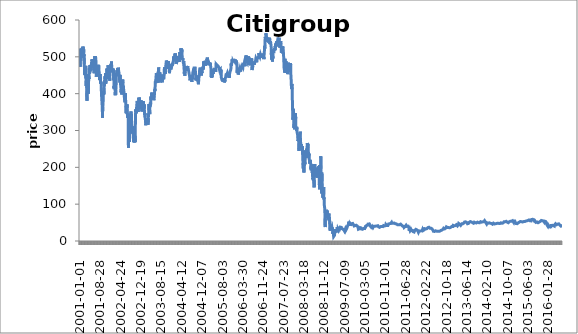
| Category | Citigroup Inc |
|---|---|
|  2001-01-01  | 478.57 |
| 2001-01-02 | 473.29 |
| 2001-01-03 | 514.88 |
| 2001-01-04 | 521.91 |
| 2001-01-05 | 503.17 |
| 2001-01-08 | 500.23 |
| 2001-01-09 | 489.11 |
| 2001-01-10 | 505.51 |
| 2001-01-11 | 515.46 |
| 2001-01-12 | 497.89 |
| 2001-01-15 | 497.89 |
| 2001-01-16 | 512.54 |
| 2001-01-17 | 504.34 |
| 2001-01-18 | 508.44 |
| 2001-01-19 | 509.61 |
| 2001-01-22 | 504.92 |
| 2001-01-23 | 514.29 |
| 2001-01-24 | 523.08 |
| 2001-01-25 | 518.4 |
| 2001-01-26 | 517.22 |
| 2001-01-29 | 526.71 |
| 2001-01-30 | 526.71 |
| 2001-01-31 | 524.55 |
| 2001-02-01 | 525.87 |
| 2001-02-02 | 519.78 |
| 2001-02-05 | 527.65 |
| 2001-02-06 | 516.68 |
| 2001-02-07 | 509.47 |
| 2001-02-08 | 507.03 |
| 2001-02-09 | 506.56 |
| 2001-02-12 | 519.68 |
| 2001-02-13 | 511.62 |
| 2001-02-14 | 502.81 |
| 2001-02-15 | 506.75 |
| 2001-02-16 | 506.09 |
| 2001-02-19 | 506.09 |
| 2001-02-20 | 479.85 |
| 2001-02-21 | 452.67 |
| 2001-02-22 | 455.48 |
| 2001-02-23 | 451.73 |
| 2001-02-26 | 471.42 |
| 2001-02-27 | 466.73 |
| 2001-02-28 | 460.92 |
| 2001-03-01 | 455.95 |
| 2001-03-02 | 449.86 |
| 2001-03-05 | 452.2 |
| 2001-03-06 | 455.76 |
| 2001-03-07 | 472.82 |
| 2001-03-08 | 475.63 |
| 2001-03-09 | 460.45 |
| 2001-03-12 | 441.42 |
| 2001-03-13 | 453.51 |
| 2001-03-14 | 420.81 |
| 2001-03-15 | 434.86 |
| 2001-03-16 | 426.43 |
| 2001-03-19 | 433.93 |
| 2001-03-20 | 415.18 |
| 2001-03-21 | 395.97 |
| 2001-03-22 | 380.51 |
| 2001-03-23 | 401.59 |
| 2001-03-26 | 414.25 |
| 2001-03-27 | 435.33 |
| 2001-03-28 | 422.68 |
| 2001-03-29 | 418.93 |
| 2001-03-30 | 421.56 |
| 2001-04-02 | 428.3 |
| 2001-04-03 | 409.56 |
| 2001-04-04 | 400.19 |
| 2001-04-05 | 421.74 |
| 2001-04-06 | 400.66 |
| 2001-04-09 | 401.41 |
| 2001-04-10 | 425.49 |
| 2001-04-11 | 434.3 |
| 2001-04-12 | 443.3 |
| 2001-04-13 | 443.3 |
| 2001-04-16 | 440.02 |
| 2001-04-17 | 449.11 |
| 2001-04-18 | 469.07 |
| 2001-04-19 | 471.42 |
| 2001-04-20 | 463.17 |
| 2001-04-23 | 454.45 |
| 2001-04-24 | 456.42 |
| 2001-04-25 | 461.86 |
| 2001-04-26 | 464.01 |
| 2001-04-27 | 477.97 |
| 2001-04-30 | 460.64 |
| 2001-05-01 | 473.01 |
| 2001-05-02 | 474.23 |
| 2001-05-03 | 477.98 |
| 2001-05-04 | 475.91 |
| 2001-05-07 | 474.7 |
| 2001-05-08 | 466.64 |
| 2001-05-09 | 463.45 |
| 2001-05-10 | 464.85 |
| 2001-05-11 | 461.67 |
| 2001-05-14 | 469.54 |
| 2001-05-15 | 473.76 |
| 2001-05-16 | 485.38 |
| 2001-05-17 | 475.07 |
| 2001-05-18 | 476.66 |
| 2001-05-21 | 483.22 |
| 2001-05-22 | 492.41 |
| 2001-05-23 | 487.44 |
| 2001-05-24 | 492.69 |
| 2001-05-25 | 486.04 |
| 2001-05-28 | 486.04 |
| 2001-05-29 | 483.6 |
| 2001-05-30 | 475.91 |
| 2001-05-31 | 480.32 |
| 2001-06-01 | 485.47 |
| 2001-06-04 | 489.97 |
| 2001-06-05 | 492.69 |
| 2001-06-06 | 486.04 |
| 2001-06-07 | 483.6 |
| 2001-06-08 | 477.51 |
| 2001-06-11 | 472.35 |
| 2001-06-12 | 472.16 |
| 2001-06-13 | 467.57 |
| 2001-06-14 | 455.58 |
| 2001-06-15 | 462.04 |
| 2001-06-18 | 468.6 |
| 2001-06-19 | 475.63 |
| 2001-06-20 | 474.7 |
| 2001-06-21 | 501.87 |
| 2001-06-22 | 500.47 |
| 2001-06-25 | 492.5 |
| 2001-06-26 | 488.75 |
| 2001-06-27 | 484.07 |
| 2001-06-28 | 492.97 |
| 2001-06-29 | 495.22 |
| 2001-07-02 | 501.22 |
| 2001-07-03 | 497.19 |
| 2001-07-04 | 497.19 |
| 2001-07-05 | 489.97 |
| 2001-07-06 | 476.01 |
| 2001-07-09 | 476.1 |
| 2001-07-10 | 460.36 |
| 2001-07-11 | 446.11 |
| 2001-07-12 | 456.42 |
| 2001-07-13 | 457.92 |
| 2001-07-16 | 460.64 |
| 2001-07-17 | 476.1 |
| 2001-07-18 | 474.41 |
| 2001-07-19 | 470.01 |
| 2001-07-20 | 473.85 |
| 2001-07-23 | 470.67 |
| 2001-07-24 | 458.95 |
| 2001-07-25 | 462.51 |
| 2001-07-26 | 469.92 |
| 2001-07-27 | 470.85 |
| 2001-07-30 | 465.23 |
| 2001-07-31 | 470.57 |
| 2001-08-01 | 474.6 |
| 2001-08-02 | 478.44 |
| 2001-08-03 | 480.79 |
| 2001-08-06 | 472.35 |
| 2001-08-07 | 477.22 |
| 2001-08-08 | 464.85 |
| 2001-08-09 | 463.07 |
| 2001-08-10 | 466.64 |
| 2001-08-13 | 460.45 |
| 2001-08-14 | 456.89 |
| 2001-08-15 | 455.48 |
| 2001-08-16 | 448.73 |
| 2001-08-17 | 436.74 |
| 2001-08-20 | 444.24 |
| 2001-08-21 | 440.49 |
| 2001-08-22 | 440.49 |
| 2001-08-23 | 438.52 |
| 2001-08-24 | 452.67 |
| 2001-08-27 | 449.86 |
| 2001-08-28 | 440.96 |
| 2001-08-29 | 435.33 |
| 2001-08-30 | 426.71 |
| 2001-08-31 | 428.77 |
| 2001-09-03 | 428.77 |
| 2001-09-04 | 432.61 |
| 2001-09-05 | 427.18 |
| 2001-09-06 | 412.84 |
| 2001-09-07 | 406.94 |
| 2001-09-10 | 397.84 |
| 2001-09-11 | 397.84 |
| 2001-09-12 | 397.84 |
| 2001-09-13 | 397.84 |
| 2001-09-14 | 397.84 |
| 2001-09-17 | 371.13 |
| 2001-09-18 | 368.7 |
| 2001-09-19 | 360.36 |
| 2001-09-20 | 340.77 |
| 2001-09-21 | 334.65 |
| 2001-09-24 | 365.51 |
| 2001-09-25 | 365.89 |
| 2001-09-26 | 368.42 |
| 2001-09-27 | 374.79 |
| 2001-09-28 | 379.57 |
| 2001-10-01 | 391.28 |
| 2001-10-02 | 396.91 |
| 2001-10-03 | 407.5 |
| 2001-10-04 | 408.81 |
| 2001-10-05 | 403.94 |
| 2001-10-08 | 397.56 |
| 2001-10-09 | 400.19 |
| 2001-10-10 | 415.28 |
| 2001-10-11 | 428.77 |
| 2001-10-12 | 422.31 |
| 2001-10-15 | 419.87 |
| 2001-10-16 | 431.96 |
| 2001-10-17 | 436.36 |
| 2001-10-18 | 435.8 |
| 2001-10-19 | 426.13 |
| 2001-10-22 | 440.58 |
| 2001-10-23 | 447.99 |
| 2001-10-24 | 439.93 |
| 2001-10-25 | 450.8 |
| 2001-10-26 | 455.3 |
| 2001-10-29 | 434.86 |
| 2001-10-30 | 426.9 |
| 2001-10-31 | 426.62 |
| 2001-11-01 | 435.61 |
| 2001-11-02 | 439.83 |
| 2001-11-05 | 443.02 |
| 2001-11-06 | 446.77 |
| 2001-11-07 | 450.8 |
| 2001-11-08 | 454.55 |
| 2001-11-09 | 452.67 |
| 2001-11-12 | 451.73 |
| 2001-11-13 | 468.13 |
| 2001-11-14 | 470.04 |
| 2001-11-15 | 469.45 |
| 2001-11-16 | 457.36 |
| 2001-11-19 | 464.85 |
| 2001-11-20 | 464.39 |
| 2001-11-21 | 458.29 |
| 2001-11-22 | 458.29 |
| 2001-11-23 | 468.04 |
| 2001-11-26 | 476.94 |
| 2001-11-27 | 473.76 |
| 2001-11-28 | 447.99 |
| 2001-11-29 | 448.76 |
| 2001-11-30 | 448.92 |
| 2001-12-03 | 439.64 |
| 2001-12-04 | 448.27 |
| 2001-12-05 | 459.23 |
| 2001-12-06 | 464.85 |
| 2001-12-07 | 461.2 |
| 2001-12-10 | 452.56 |
| 2001-12-11 | 455.58 |
| 2001-12-12 | 451.27 |
| 2001-12-13 | 444.7 |
| 2001-12-14 | 435.28 |
| 2001-12-17 | 443.96 |
| 2001-12-18 | 450.8 |
| 2001-12-19 | 468.6 |
| 2001-12-20 | 465.89 |
| 2001-12-21 | 470.01 |
| 2001-12-24 | 468.32 |
| 2001-12-25 | 468.32 |
| 2001-12-26 | 470.67 |
| 2001-12-27 | 475.54 |
| 2001-12-28 | 479.76 |
| 2001-12-31 | 473.1 |
| 2002-01-01 | 473.1 |
| 2002-01-02 | 478.07 |
| 2002-01-03 | 478.44 |
| 2002-01-04 | 487.35 |
| 2002-01-07 | 481.63 |
| 2002-01-08 | 463.92 |
| 2002-01-09 | 466.64 |
| 2002-01-10 | 467.2 |
| 2002-01-11 | 459.89 |
| 2002-01-14 | 458.11 |
| 2002-01-15 | 466.73 |
| 2002-01-16 | 457.92 |
| 2002-01-17 | 467.67 |
| 2002-01-18 | 468.23 |
| 2002-01-21 | 468.23 |
| 2002-01-22 | 461.11 |
| 2002-01-23 | 463.92 |
| 2002-01-24 | 467.67 |
| 2002-01-25 | 465.04 |
| 2002-01-28 | 462.14 |
| 2002-01-29 | 437.77 |
| 2002-01-30 | 447.05 |
| 2002-01-31 | 440.17 |
| 2002-02-01 | 435.71 |
| 2002-02-04 | 415.18 |
| 2002-02-05 | 419.87 |
| 2002-02-06 | 412.37 |
| 2002-02-07 | 413.68 |
| 2002-02-08 | 426.34 |
| 2002-02-11 | 430.18 |
| 2002-02-12 | 423.15 |
| 2002-02-13 | 425.02 |
| 2002-02-14 | 426.9 |
| 2002-02-15 | 413.59 |
| 2002-02-18 | 413.59 |
| 2002-02-19 | 395.69 |
| 2002-02-20 | 409.18 |
| 2002-02-21 | 401.12 |
| 2002-02-22 | 397.38 |
| 2002-02-25 | 410.4 |
| 2002-02-26 | 410.5 |
| 2002-02-27 | 414.62 |
| 2002-02-28 | 424.09 |
| 2002-03-01 | 430.08 |
| 2002-03-04 | 446.2 |
| 2002-03-05 | 447.05 |
| 2002-03-06 | 456.42 |
| 2002-03-07 | 456.61 |
| 2002-03-08 | 458.01 |
| 2002-03-11 | 458.29 |
| 2002-03-12 | 463.45 |
| 2002-03-13 | 453.51 |
| 2002-03-14 | 457.45 |
| 2002-03-15 | 465.7 |
| 2002-03-18 | 464.39 |
| 2002-03-19 | 469.92 |
| 2002-03-20 | 461.57 |
| 2002-03-21 | 464.85 |
| 2002-03-22 | 467.1 |
| 2002-03-25 | 455.95 |
| 2002-03-26 | 460.64 |
| 2002-03-27 | 470.57 |
| 2002-03-28 | 464.1 |
| 2002-03-29 | 464.1 |
| 2002-04-01 | 463.45 |
| 2002-04-02 | 463.45 |
| 2002-04-03 | 457.08 |
| 2002-04-04 | 457.17 |
| 2002-04-05 | 456.14 |
| 2002-04-08 | 455.48 |
| 2002-04-09 | 457.73 |
| 2002-04-10 | 455.76 |
| 2002-04-11 | 438.24 |
| 2002-04-12 | 441.42 |
| 2002-04-15 | 430.37 |
| 2002-04-16 | 450.89 |
| 2002-04-17 | 446.3 |
| 2002-04-18 | 440.96 |
| 2002-04-19 | 436.08 |
| 2002-04-22 | 425.96 |
| 2002-04-23 | 426.43 |
| 2002-04-24 | 418.93 |
| 2002-04-25 | 415.65 |
| 2002-04-26 | 403.47 |
| 2002-04-29 | 401.87 |
| 2002-04-30 | 405.81 |
| 2002-05-01 | 412 |
| 2002-05-02 | 421.28 |
| 2002-05-03 | 415.09 |
| 2002-05-06 | 397.66 |
| 2002-05-07 | 395.03 |
| 2002-05-08 | 419.59 |
| 2002-05-09 | 415.46 |
| 2002-05-10 | 405.81 |
| 2002-05-13 | 414.62 |
| 2002-05-14 | 425.49 |
| 2002-05-15 | 432.03 |
| 2002-05-16 | 434.4 |
| 2002-05-17 | 438.43 |
| 2002-05-20 | 429.71 |
| 2002-05-21 | 424.18 |
| 2002-05-22 | 422.21 |
| 2002-05-23 | 424.93 |
| 2002-05-24 | 420.06 |
| 2002-05-27 | 420.06 |
| 2002-05-28 | 412.18 |
| 2002-05-29 | 407.69 |
| 2002-05-30 | 406.19 |
| 2002-05-31 | 404.69 |
| 2002-06-03 | 397.38 |
| 2002-06-04 | 393.53 |
| 2002-06-05 | 393.61 |
| 2002-06-06 | 393.63 |
| 2002-06-07 | 384.25 |
| 2002-06-10 | 386.77 |
| 2002-06-11 | 381.54 |
| 2002-06-12 | 380.3 |
| 2002-06-13 | 376.57 |
| 2002-06-14 | 376.76 |
| 2002-06-17 | 401.41 |
| 2002-06-18 | 401.24 |
| 2002-06-19 | 394.19 |
| 2002-06-20 | 379.48 |
| 2002-06-21 | 373.01 |
| 2002-06-24 | 371.04 |
| 2002-06-25 | 366.64 |
| 2002-06-26 | 346.77 |
| 2002-06-27 | 368.13 |
| 2002-06-28 | 363.17 |
| 2002-07-01 | 360.73 |
| 2002-07-02 | 351.27 |
| 2002-07-03 | 346.86 |
| 2002-07-04 | 346.86 |
| 2002-07-05 | 370.85 |
| 2002-07-08 | 360.54 |
| 2002-07-09 | 352.11 |
| 2002-07-10 | 347.69 |
| 2002-07-11 | 338.33 |
| 2002-07-12 | 340.67 |
| 2002-07-15 | 334.23 |
| 2002-07-16 | 339.27 |
| 2002-07-17 | 346.11 |
| 2002-07-18 | 345.83 |
| 2002-07-19 | 337.39 |
| 2002-07-22 | 300.28 |
| 2002-07-23 | 253.05 |
| 2002-07-24 | 277.32 |
| 2002-07-25 | 277.88 |
| 2002-07-26 | 288.1 |
| 2002-07-29 | 312.18 |
| 2002-07-30 | 318.56 |
| 2002-07-31 | 314.34 |
| 2002-08-01 | 302.72 |
| 2002-08-02 | 289.41 |
| 2002-08-05 | 268.51 |
| 2002-08-06 | 284.91 |
| 2002-08-07 | 295.41 |
| 2002-08-08 | 317.71 |
| 2002-08-09 | 321.56 |
| 2002-08-12 | 319.4 |
| 2002-08-13 | 310.22 |
| 2002-08-14 | 331.3 |
| 2002-08-15 | 335.9 |
| 2002-08-16 | 327.09 |
| 2002-08-19 | 340.68 |
| 2002-08-20 | 335.43 |
| 2002-08-21 | 343.5 |
| 2002-08-22 | 351.8 |
| 2002-08-23 | 340 |
| 2002-08-26 | 344 |
| 2002-08-27 | 342 |
| 2002-08-28 | 331.5 |
| 2002-08-29 | 328.2 |
| 2002-08-30 | 327.5 |
| 2002-09-02 | 327.5 |
| 2002-09-03 | 293.9 |
| 2002-09-04 | 303 |
| 2002-09-05 | 293 |
| 2002-09-06 | 302.8 |
| 2002-09-09 | 310.7 |
| 2002-09-10 | 308.7 |
| 2002-09-11 | 301.4 |
| 2002-09-12 | 291.5 |
| 2002-09-13 | 293.8 |
| 2002-09-16 | 298.8 |
| 2002-09-17 | 298 |
| 2002-09-18 | 291.1 |
| 2002-09-19 | 276.5 |
| 2002-09-20 | 268.3 |
| 2002-09-23 | 275.7 |
| 2002-09-24 | 272 |
| 2002-09-25 | 280.8 |
| 2002-09-26 | 295.1 |
| 2002-09-27 | 290.2 |
| 2002-09-30 | 296.5 |
| 2002-10-01 | 310 |
| 2002-10-02 | 296 |
| 2002-10-03 | 285.1 |
| 2002-10-04 | 279.8 |
| 2002-10-07 | 267.3 |
| 2002-10-08 | 278.4 |
| 2002-10-09 | 268.9 |
| 2002-10-10 | 285.7 |
| 2002-10-11 | 304 |
| 2002-10-14 | 303.1 |
| 2002-10-15 | 341.4 |
| 2002-10-16 | 338.69 |
| 2002-10-17 | 357.5 |
| 2002-10-18 | 349.8 |
| 2002-10-21 | 355.2 |
| 2002-10-22 | 355.3 |
| 2002-10-23 | 354.9 |
| 2002-10-24 | 346.7 |
| 2002-10-25 | 357 |
| 2002-10-28 | 363 |
| 2002-10-29 | 365 |
| 2002-10-30 | 370.8 |
| 2002-10-31 | 369.5 |
| 2002-11-01 | 376.5 |
| 2002-11-04 | 376 |
| 2002-11-05 | 380.1 |
| 2002-11-06 | 378.9 |
| 2002-11-07 | 364.5 |
| 2002-11-08 | 368.7 |
| 2002-11-11 | 357 |
| 2002-11-12 | 363.9 |
| 2002-11-13 | 350 |
| 2002-11-14 | 361.4 |
| 2002-11-15 | 369 |
| 2002-11-18 | 358.2 |
| 2002-11-19 | 364.4 |
| 2002-11-20 | 377.9 |
| 2002-11-21 | 389 |
| 2002-11-22 | 385.4 |
| 2002-11-25 | 386.5 |
| 2002-11-26 | 371 |
| 2002-11-27 | 389.1 |
| 2002-11-28 | 389.1 |
| 2002-11-29 | 388.8 |
| 2002-12-02 | 385.2 |
| 2002-12-03 | 377 |
| 2002-12-04 | 378.5 |
| 2002-12-05 | 371.4 |
| 2002-12-06 | 375.6 |
| 2002-12-09 | 361.5 |
| 2002-12-10 | 367.9 |
| 2002-12-11 | 362.6 |
| 2002-12-12 | 366.2 |
| 2002-12-13 | 360 |
| 2002-12-16 | 374.8 |
| 2002-12-17 | 371.3 |
| 2002-12-18 | 371.5 |
| 2002-12-19 | 370 |
| 2002-12-20 | 381.4 |
| 2002-12-23 | 376.8 |
| 2002-12-24 | 365 |
| 2002-12-25 | 365 |
| 2002-12-26 | 360.2 |
| 2002-12-27 | 351.7 |
| 2002-12-30 | 352.5 |
| 2002-12-31 | 351.9 |
| 2003-01-01 | 351.9 |
| 2003-01-02 | 363.5 |
| 2003-01-03 | 361.1 |
| 2003-01-06 | 373.1 |
| 2003-01-07 | 369.8 |
| 2003-01-08 | 366.9 |
| 2003-01-09 | 370.3 |
| 2003-01-10 | 374.6 |
| 2003-01-13 | 370.4 |
| 2003-01-14 | 379.5 |
| 2003-01-15 | 374.5 |
| 2003-01-16 | 371.1 |
| 2003-01-17 | 368 |
| 2003-01-20 | 368 |
| 2003-01-21 | 361.4 |
| 2003-01-22 | 359 |
| 2003-01-23 | 371.4 |
| 2003-01-24 | 357.9 |
| 2003-01-27 | 350.9 |
| 2003-01-28 | 354.6 |
| 2003-01-29 | 355.5 |
| 2003-01-30 | 342 |
| 2003-01-31 | 343.8 |
| 2003-02-03 | 346.5 |
| 2003-02-04 | 336.4 |
| 2003-02-05 | 336.5 |
| 2003-02-06 | 331.5 |
| 2003-02-07 | 329.1 |
| 2003-02-10 | 328.9 |
| 2003-02-11 | 320.5 |
| 2003-02-12 | 314.2 |
| 2003-02-13 | 318.4 |
| 2003-02-14 | 325.4 |
| 2003-02-17 | 325.4 |
| 2003-02-18 | 332.4 |
| 2003-02-19 | 333.6 |
| 2003-02-20 | 328.6 |
| 2003-02-21 | 332 |
| 2003-02-24 | 324.3 |
| 2003-02-25 | 328.9 |
| 2003-02-26 | 322.6 |
| 2003-02-27 | 328.6 |
| 2003-02-28 | 333.4 |
| 2003-03-03 | 330.5 |
| 2003-03-04 | 323.7 |
| 2003-03-05 | 331.7 |
| 2003-03-06 | 327.9 |
| 2003-03-07 | 331.6 |
| 2003-03-10 | 322 |
| 2003-03-11 | 315.5 |
| 2003-03-12 | 316.6 |
| 2003-03-13 | 333.9 |
| 2003-03-14 | 337.5 |
| 2003-03-17 | 342 |
| 2003-03-18 | 347.3 |
| 2003-03-19 | 354.6 |
| 2003-03-20 | 358.3 |
| 2003-03-21 | 372 |
| 2003-03-24 | 357 |
| 2003-03-25 | 359 |
| 2003-03-26 | 358.9 |
| 2003-03-27 | 359 |
| 2003-03-28 | 354.2 |
| 2003-03-31 | 344.5 |
| 2003-04-01 | 356 |
| 2003-04-02 | 370.4 |
| 2003-04-03 | 365.2 |
| 2003-04-04 | 373 |
| 2003-04-07 | 372.2 |
| 2003-04-08 | 376.1 |
| 2003-04-09 | 370.4 |
| 2003-04-10 | 369.5 |
| 2003-04-11 | 373.5 |
| 2003-04-14 | 384.3 |
| 2003-04-15 | 392.5 |
| 2003-04-16 | 382.6 |
| 2003-04-17 | 390.4 |
| 2003-04-18 | 390.4 |
| 2003-04-21 | 387 |
| 2003-04-22 | 399.4 |
| 2003-04-23 | 402.9 |
| 2003-04-24 | 391.8 |
| 2003-04-25 | 384.5 |
| 2003-04-28 | 392.6 |
| 2003-04-29 | 391 |
| 2003-04-30 | 392.5 |
| 2003-05-01 | 391.8 |
| 2003-05-02 | 397 |
| 2003-05-05 | 395.3 |
| 2003-05-06 | 399.5 |
| 2003-05-07 | 400.2 |
| 2003-05-08 | 392.1 |
| 2003-05-09 | 390.5 |
| 2003-05-12 | 393.9 |
| 2003-05-13 | 392.7 |
| 2003-05-14 | 389 |
| 2003-05-15 | 394.5 |
| 2003-05-16 | 391.5 |
| 2003-05-19 | 382.3 |
| 2003-05-20 | 385.2 |
| 2003-05-21 | 388.6 |
| 2003-05-22 | 387.2 |
| 2003-05-23 | 390.9 |
| 2003-05-26 | 390.9 |
| 2003-05-27 | 402.5 |
| 2003-05-28 | 411.4 |
| 2003-05-29 | 407.7 |
| 2003-05-30 | 410.2 |
| 2003-06-02 | 413.7 |
| 2003-06-03 | 422.6 |
| 2003-06-04 | 430.2 |
| 2003-06-05 | 435 |
| 2003-06-06 | 436.9 |
| 2003-06-09 | 428.6 |
| 2003-06-10 | 432 |
| 2003-06-11 | 440.9 |
| 2003-06-12 | 440.7 |
| 2003-06-13 | 441 |
| 2003-06-16 | 452.4 |
| 2003-06-17 | 455.6 |
| 2003-06-18 | 449.1 |
| 2003-06-19 | 437.9 |
| 2003-06-20 | 440.5 |
| 2003-06-23 | 431 |
| 2003-06-24 | 434.2 |
| 2003-06-25 | 430.5 |
| 2003-06-26 | 437.2 |
| 2003-06-27 | 430.1 |
| 2003-06-30 | 428 |
| 2003-07-01 | 438.1 |
| 2003-07-02 | 444 |
| 2003-07-03 | 438.8 |
| 2003-07-04 | 438.8 |
| 2003-07-07 | 449.4 |
| 2003-07-08 | 454.9 |
| 2003-07-09 | 459.9 |
| 2003-07-10 | 452 |
| 2003-07-11 | 461.5 |
| 2003-07-14 | 471.2 |
| 2003-07-15 | 468.3 |
| 2003-07-16 | 455.2 |
| 2003-07-17 | 448.2 |
| 2003-07-18 | 457.4 |
| 2003-07-21 | 449.5 |
| 2003-07-22 | 454.5 |
| 2003-07-23 | 457.1 |
| 2003-07-24 | 448.7 |
| 2003-07-25 | 457.3 |
| 2003-07-28 | 458 |
| 2003-07-29 | 454.4 |
| 2003-07-30 | 452.3 |
| 2003-07-31 | 448 |
| 2003-08-01 | 434.5 |
| 2003-08-04 | 438.7 |
| 2003-08-05 | 430.7 |
| 2003-08-06 | 435.2 |
| 2003-08-07 | 441.8 |
| 2003-08-08 | 444 |
| 2003-08-11 | 445.5 |
| 2003-08-12 | 451.9 |
| 2003-08-13 | 449.7 |
| 2003-08-14 | 451.7 |
| 2003-08-15 | 449 |
| 2003-08-18 | 446.5 |
| 2003-08-19 | 444.1 |
| 2003-08-20 | 441.6 |
| 2003-08-21 | 439.1 |
| 2003-08-22 | 431 |
| 2003-08-25 | 429.2 |
| 2003-08-26 | 433.1 |
| 2003-08-27 | 429.6 |
| 2003-08-28 | 430.9 |
| 2003-08-29 | 433.5 |
| 2003-09-01 | 433.5 |
| 2003-09-02 | 441.8 |
| 2003-09-03 | 445 |
| 2003-09-04 | 444.1 |
| 2003-09-05 | 443.4 |
| 2003-09-08 | 445.2 |
| 2003-09-09 | 442.8 |
| 2003-09-10 | 439.5 |
| 2003-09-11 | 442.1 |
| 2003-09-12 | 443 |
| 2003-09-15 | 441.6 |
| 2003-09-16 | 447.8 |
| 2003-09-17 | 449.4 |
| 2003-09-18 | 466.5 |
| 2003-09-19 | 469.9 |
| 2003-09-22 | 463.8 |
| 2003-09-23 | 471.9 |
| 2003-09-24 | 465.3 |
| 2003-09-25 | 459.7 |
| 2003-09-26 | 453.6 |
| 2003-09-29 | 460.7 |
| 2003-09-30 | 455.1 |
| 2003-10-01 | 470 |
| 2003-10-02 | 472.5 |
| 2003-10-03 | 471.1 |
| 2003-10-06 | 473.1 |
| 2003-10-07 | 478.3 |
| 2003-10-08 | 475.6 |
| 2003-10-09 | 478.8 |
| 2003-10-10 | 479 |
| 2003-10-13 | 489.9 |
| 2003-10-14 | 490.4 |
| 2003-10-15 | 491.2 |
| 2003-10-16 | 491.5 |
| 2003-10-17 | 483.8 |
| 2003-10-20 | 481.4 |
| 2003-10-21 | 475.7 |
| 2003-10-22 | 472 |
| 2003-10-23 | 477.8 |
| 2003-10-24 | 476 |
| 2003-10-27 | 467 |
| 2003-10-28 | 475.8 |
| 2003-10-29 | 475.9 |
| 2003-10-30 | 475.2 |
| 2003-10-31 | 474 |
| 2003-11-03 | 480.4 |
| 2003-11-04 | 484.67 |
| 2003-11-05 | 485 |
| 2003-11-06 | 488.9 |
| 2003-11-07 | 477.5 |
| 2003-11-10 | 479.5 |
| 2003-11-11 | 473.9 |
| 2003-11-12 | 473.9 |
| 2003-11-13 | 471 |
| 2003-11-14 | 464.3 |
| 2003-11-17 | 463 |
| 2003-11-18 | 455.6 |
| 2003-11-19 | 459.4 |
| 2003-11-20 | 457.7 |
| 2003-11-21 | 463 |
| 2003-11-24 | 467.4 |
| 2003-11-25 | 469.1 |
| 2003-11-26 | 469.5 |
| 2003-11-27 | 469.5 |
| 2003-11-28 | 470.3 |
| 2003-12-01 | 475.6 |
| 2003-12-02 | 472.2 |
| 2003-12-03 | 469.5 |
| 2003-12-04 | 471.9 |
| 2003-12-05 | 465.8 |
| 2003-12-08 | 474 |
| 2003-12-09 | 470.9 |
| 2003-12-10 | 473.6 |
| 2003-12-11 | 475.7 |
| 2003-12-12 | 475.5 |
| 2003-12-15 | 477.8 |
| 2003-12-16 | 479.79 |
| 2003-12-17 | 474.9 |
| 2003-12-18 | 478.9 |
| 2003-12-19 | 482.7 |
| 2003-12-22 | 485 |
| 2003-12-23 | 480.7 |
| 2003-12-24 | 478.5 |
| 2003-12-25 | 478.5 |
| 2003-12-26 | 478.6 |
| 2003-12-29 | 483.9 |
| 2003-12-30 | 484.3 |
| 2003-12-31 | 485.4 |
| 2004-01-01 | 485.4 |
| 2004-01-02 | 490 |
| 2004-01-05 | 497.9 |
| 2004-01-06 | 498.4 |
| 2004-01-07 | 499.1 |
| 2004-01-08 | 501.2 |
| 2004-01-09 | 498.5 |
| 2004-01-12 | 498.5 |
| 2004-01-13 | 496 |
| 2004-01-14 | 500 |
| 2004-01-15 | 495 |
| 2004-01-16 | 495 |
| 2004-01-19 | 495 |
| 2004-01-20 | 492.9 |
| 2004-01-21 | 503.6 |
| 2004-01-22 | 506.9 |
| 2004-01-23 | 503.2 |
| 2004-01-26 | 509.3 |
| 2004-01-27 | 500.7 |
| 2004-01-28 | 492.3 |
| 2004-01-29 | 494.8 |
| 2004-01-30 | 494.8 |
| 2004-02-02 | 492.3 |
| 2004-02-03 | 488.8 |
| 2004-02-04 | 485.7 |
| 2004-02-05 | 481.1 |
| 2004-02-06 | 493.1 |
| 2004-02-09 | 491.5 |
| 2004-02-10 | 489.2 |
| 2004-02-11 | 497.4 |
| 2004-02-12 | 495.1 |
| 2004-02-13 | 494.9 |
| 2004-02-16 | 494.9 |
| 2004-02-17 | 499 |
| 2004-02-18 | 495.6 |
| 2004-02-19 | 491.2 |
| 2004-02-20 | 488.9 |
| 2004-02-23 | 493.2 |
| 2004-02-24 | 494.4 |
| 2004-02-25 | 498.4 |
| 2004-02-26 | 500 |
| 2004-02-27 | 502.6 |
| 2004-03-01 | 504.6 |
| 2004-03-02 | 497.7 |
| 2004-03-03 | 498.2 |
| 2004-03-04 | 493.8 |
| 2004-03-05 | 500 |
| 2004-03-08 | 499.4 |
| 2004-03-09 | 498.4 |
| 2004-03-10 | 492.1 |
| 2004-03-11 | 486.2 |
| 2004-03-12 | 493.1 |
| 2004-03-15 | 491.2 |
| 2004-03-16 | 499.9 |
| 2004-03-17 | 508.2 |
| 2004-03-18 | 512.8 |
| 2004-03-19 | 503.4 |
| 2004-03-22 | 496.1 |
| 2004-03-23 | 498 |
| 2004-03-24 | 497.9 |
| 2004-03-25 | 502.6 |
| 2004-03-26 | 500.6 |
| 2004-03-29 | 513.2 |
| 2004-03-30 | 519.4 |
| 2004-03-31 | 517 |
| 2004-04-01 | 522.9 |
| 2004-04-02 | 518 |
| 2004-04-05 | 522.3 |
| 2004-04-06 | 522.4 |
| 2004-04-07 | 517.1 |
| 2004-04-08 | 515.3 |
| 2004-04-09 | 515.3 |
| 2004-04-12 | 520.6 |
| 2004-04-13 | 512 |
| 2004-04-14 | 509.5 |
| 2004-04-15 | 499.2 |
| 2004-04-16 | 501 |
| 2004-04-19 | 499.8 |
| 2004-04-20 | 492.5 |
| 2004-04-21 | 491.4 |
| 2004-04-22 | 496.6 |
| 2004-04-23 | 491.8 |
| 2004-04-26 | 489.9 |
| 2004-04-27 | 489.6 |
| 2004-04-28 | 484.3 |
| 2004-04-29 | 481.7 |
| 2004-04-30 | 480.9 |
| 2004-05-03 | 485.6 |
| 2004-05-04 | 488.4 |
| 2004-05-05 | 486.3 |
| 2004-05-06 | 475.1 |
| 2004-05-07 | 467.2 |
| 2004-05-10 | 454.1 |
| 2004-05-11 | 456.9 |
| 2004-05-12 | 463.1 |
| 2004-05-13 | 461.96 |
| 2004-05-14 | 456.5 |
| 2004-05-17 | 448.6 |
| 2004-05-18 | 451.5 |
| 2004-05-19 | 450 |
| 2004-05-20 | 452.8 |
| 2004-05-21 | 453.4 |
| 2004-05-24 | 453.8 |
| 2004-05-25 | 465 |
| 2004-05-26 | 465.4 |
| 2004-05-27 | 465.2 |
| 2004-05-28 | 464.3 |
| 2004-05-31 | 464.3 |
| 2004-06-01 | 467.7 |
| 2004-06-02 | 470.3 |
| 2004-06-03 | 465.96 |
| 2004-06-04 | 465.5 |
| 2004-06-07 | 475.3 |
| 2004-06-08 | 476 |
| 2004-06-09 | 470.5 |
| 2004-06-10 | 473.5 |
| 2004-06-11 | 473.5 |
| 2004-06-14 | 467.4 |
| 2004-06-15 | 470.2 |
| 2004-06-16 | 470.2 |
| 2004-06-17 | 470.8 |
| 2004-06-18 | 475 |
| 2004-06-21 | 471.8 |
| 2004-06-22 | 469.9 |
| 2004-06-23 | 472.4 |
| 2004-06-24 | 471.2 |
| 2004-06-25 | 468 |
| 2004-06-28 | 465.2 |
| 2004-06-29 | 463.3 |
| 2004-06-30 | 465 |
| 2004-07-01 | 460.3 |
| 2004-07-02 | 457.6 |
| 2004-07-05 | 457.6 |
| 2004-07-06 | 454.5 |
| 2004-07-07 | 456.3 |
| 2004-07-08 | 451.7 |
| 2004-07-09 | 450.3 |
| 2004-07-12 | 449 |
| 2004-07-13 | 453 |
| 2004-07-14 | 451 |
| 2004-07-15 | 442.1 |
| 2004-07-16 | 436.2 |
| 2004-07-19 | 439.9 |
| 2004-07-20 | 440.5 |
| 2004-07-21 | 439.4 |
| 2004-07-22 | 446 |
| 2004-07-23 | 443.1 |
| 2004-07-26 | 438.1 |
| 2004-07-27 | 439 |
| 2004-07-28 | 441.1 |
| 2004-07-29 | 442.8 |
| 2004-07-30 | 440.9 |
| 2004-08-02 | 443.2 |
| 2004-08-03 | 440.4 |
| 2004-08-04 | 444 |
| 2004-08-05 | 438.3 |
| 2004-08-06 | 431.9 |
| 2004-08-09 | 434.7 |
| 2004-08-10 | 441.8 |
| 2004-08-11 | 443.5 |
| 2004-08-12 | 439 |
| 2004-08-13 | 440.1 |
| 2004-08-16 | 447.7 |
| 2004-08-17 | 451.6 |
| 2004-08-18 | 456.4 |
| 2004-08-19 | 454.6 |
| 2004-08-20 | 459.5 |
| 2004-08-23 | 458.2 |
| 2004-08-24 | 459.2 |
| 2004-08-25 | 463 |
| 2004-08-26 | 464.6 |
| 2004-08-27 | 467.2 |
| 2004-08-30 | 464.1 |
| 2004-08-31 | 465.8 |
| 2004-09-01 | 464.5 |
| 2004-09-02 | 469.9 |
| 2004-09-03 | 468.4 |
| 2004-09-06 | 468.4 |
| 2004-09-07 | 472.1 |
| 2004-09-08 | 468.2 |
| 2004-09-09 | 469.5 |
| 2004-09-10 | 472.4 |
| 2004-09-13 | 470 |
| 2004-09-14 | 471.9 |
| 2004-09-15 | 469.8 |
| 2004-09-16 | 471.8 |
| 2004-09-17 | 469.5 |
| 2004-09-20 | 454 |
| 2004-09-21 | 456.5 |
| 2004-09-22 | 443.8 |
| 2004-09-23 | 438.8 |
| 2004-09-24 | 442.1 |
| 2004-09-27 | 436.1 |
| 2004-09-28 | 443.1 |
| 2004-09-29 | 447.02 |
| 2004-09-30 | 441.2 |
| 2004-10-01 | 448.7 |
| 2004-10-04 | 447.3 |
| 2004-10-05 | 445.2 |
| 2004-10-06 | 447.4 |
| 2004-10-07 | 447.6 |
| 2004-10-08 | 445.6 |
| 2004-10-11 | 448.6 |
| 2004-10-12 | 448 |
| 2004-10-13 | 441.1 |
| 2004-10-14 | 437 |
| 2004-10-15 | 439.4 |
| 2004-10-18 | 442.2 |
| 2004-10-19 | 435.9 |
| 2004-10-20 | 432.9 |
| 2004-10-21 | 429.5 |
| 2004-10-22 | 425.6 |
| 2004-10-25 | 425.8 |
| 2004-10-26 | 433.4 |
| 2004-10-27 | 439.5 |
| 2004-10-28 | 442.6 |
| 2004-10-29 | 443.7 |
| 2004-11-01 | 443.1 |
| 2004-11-02 | 449 |
| 2004-11-03 | 452.9 |
| 2004-11-04 | 460.9 |
| 2004-11-05 | 461.3 |
| 2004-11-08 | 462.5 |
| 2004-11-09 | 462.1 |
| 2004-11-10 | 460.5 |
| 2004-11-11 | 462.6 |
| 2004-11-12 | 470.7 |
| 2004-11-15 | 466.7 |
| 2004-11-16 | 460.5 |
| 2004-11-17 | 461.8 |
| 2004-11-18 | 459.1 |
| 2004-11-19 | 451.5 |
| 2004-11-22 | 451.7 |
| 2004-11-23 | 452.1 |
| 2004-11-24 | 455.2 |
| 2004-11-25 | 455.2 |
| 2004-11-26 | 454.2 |
| 2004-11-29 | 449.6 |
| 2004-11-30 | 447.5 |
| 2004-12-01 | 459.4 |
| 2004-12-02 | 457.6 |
| 2004-12-03 | 456.5 |
| 2004-12-06 | 461.7 |
| 2004-12-07 | 460 |
| 2004-12-08 | 462.9 |
| 2004-12-09 | 464.4 |
| 2004-12-10 | 459.1 |
| 2004-12-13 | 467.7 |
| 2004-12-14 | 468.7 |
| 2004-12-15 | 473.1 |
| 2004-12-16 | 470.5 |
| 2004-12-17 | 466.2 |
| 2004-12-20 | 466.9 |
| 2004-12-21 | 471.9 |
| 2004-12-22 | 483.1 |
| 2004-12-23 | 487.5 |
| 2004-12-24 | 487.5 |
| 2004-12-27 | 483.1 |
| 2004-12-28 | 483.5 |
| 2004-12-29 | 480.1 |
| 2004-12-30 | 480.3 |
| 2004-12-31 | 481.8 |
| 2005-01-03 | 482.7 |
| 2005-01-04 | 478.6 |
| 2005-01-05 | 484.6 |
| 2005-01-06 | 489.3 |
| 2005-01-07 | 486.5 |
| 2005-01-10 | 483.4 |
| 2005-01-11 | 482.2 |
| 2005-01-12 | 480.7 |
| 2005-01-13 | 476 |
| 2005-01-14 | 475.1 |
| 2005-01-17 | 475.1 |
| 2005-01-18 | 481.7 |
| 2005-01-19 | 480.4 |
| 2005-01-20 | 477.7 |
| 2005-01-21 | 479.3 |
| 2005-01-24 | 483.6 |
| 2005-01-25 | 485.1 |
| 2005-01-26 | 484.8 |
| 2005-01-27 | 485.6 |
| 2005-01-28 | 483.8 |
| 2005-01-31 | 490.5 |
| 2005-02-01 | 494.8 |
| 2005-02-02 | 496.8 |
| 2005-02-03 | 491.5 |
| 2005-02-04 | 497.8 |
| 2005-02-07 | 497.3 |
| 2005-02-08 | 494.8 |
| 2005-02-09 | 491.8 |
| 2005-02-10 | 489.8 |
| 2005-02-11 | 494 |
| 2005-02-14 | 492.5 |
| 2005-02-15 | 494 |
| 2005-02-16 | 491.8 |
| 2005-02-17 | 488 |
| 2005-02-18 | 485.7 |
| 2005-02-21 | 485.7 |
| 2005-02-22 | 479.5 |
| 2005-02-23 | 483.8 |
| 2005-02-24 | 483 |
| 2005-02-25 | 482.8 |
| 2005-02-28 | 477.2 |
| 2005-03-01 | 478.8 |
| 2005-03-02 | 481.3 |
| 2005-03-03 | 479.7 |
| 2005-03-04 | 484 |
| 2005-03-07 | 484.7 |
| 2005-03-08 | 484.7 |
| 2005-03-09 | 478.8 |
| 2005-03-10 | 481.5 |
| 2005-03-11 | 477.9 |
| 2005-03-14 | 482.2 |
| 2005-03-15 | 478 |
| 2005-03-16 | 473.7 |
| 2005-03-17 | 472.4 |
| 2005-03-18 | 468.5 |
| 2005-03-21 | 457.6 |
| 2005-03-22 | 444.4 |
| 2005-03-23 | 444.5 |
| 2005-03-24 | 445.2 |
| 2005-03-25 | 445.2 |
| 2005-03-28 | 447.7 |
| 2005-03-29 | 443.5 |
| 2005-03-30 | 449.2 |
| 2005-03-31 | 449.4 |
| 2005-04-01 | 446.2 |
| 2005-04-04 | 445.9 |
| 2005-04-05 | 449.4 |
| 2005-04-06 | 451.5 |
| 2005-04-07 | 454.6 |
| 2005-04-08 | 454 |
| 2005-04-11 | 456.1 |
| 2005-04-12 | 464.5 |
| 2005-04-13 | 458.1 |
| 2005-04-14 | 454 |
| 2005-04-15 | 457.5 |
| 2005-04-18 | 462.1 |
| 2005-04-19 | 463.5 |
| 2005-04-20 | 461.3 |
| 2005-04-21 | 462.7 |
| 2005-04-22 | 463.2 |
| 2005-04-25 | 467.8 |
| 2005-04-26 | 466.2 |
| 2005-04-27 | 470.5 |
| 2005-04-28 | 461.9 |
| 2005-04-29 | 469.6 |
| 2005-05-02 | 465.3 |
| 2005-05-03 | 468 |
| 2005-05-04 | 469.7 |
| 2005-05-05 | 468.8 |
| 2005-05-06 | 465.9 |
| 2005-05-09 | 468.5 |
| 2005-05-10 | 463.8 |
| 2005-05-11 | 467 |
| 2005-05-12 | 464.1 |
| 2005-05-13 | 459.1 |
| 2005-05-16 | 468 |
| 2005-05-17 | 471.6 |
| 2005-05-18 | 477.4 |
| 2005-05-19 | 478.4 |
| 2005-05-20 | 478 |
| 2005-05-23 | 476 |
| 2005-05-24 | 477.1 |
| 2005-05-25 | 474.5 |
| 2005-05-26 | 473.8 |
| 2005-05-27 | 472.8 |
| 2005-05-30 | 472.8 |
| 2005-05-31 | 471.1 |
| 2005-06-01 | 477.2 |
| 2005-06-02 | 477.1 |
| 2005-06-03 | 475.6 |
| 2005-06-06 | 476.9 |
| 2005-06-07 | 476.6 |
| 2005-06-08 | 477.5 |
| 2005-06-09 | 476.8 |
| 2005-06-10 | 476.4 |
| 2005-06-13 | 476 |
| 2005-06-14 | 474.1 |
| 2005-06-15 | 474 |
| 2005-06-16 | 475.4 |
| 2005-06-17 | 474.6 |
| 2005-06-20 | 473.7 |
| 2005-06-21 | 473.2 |
| 2005-06-22 | 474.4 |
| 2005-06-23 | 468.8 |
| 2005-06-24 | 469.5 |
| 2005-06-27 | 467.7 |
| 2005-06-28 | 470.2 |
| 2005-06-29 | 467.8 |
| 2005-06-30 | 462.3 |
| 2005-07-01 | 461.6 |
| 2005-07-04 | 461.6 |
| 2005-07-05 | 464.6 |
| 2005-07-06 | 463 |
| 2005-07-07 | 462.7 |
| 2005-07-08 | 465.1 |
| 2005-07-11 | 461.1 |
| 2005-07-12 | 460 |
| 2005-07-13 | 457.4 |
| 2005-07-14 | 465 |
| 2005-07-15 | 464.2 |
| 2005-07-18 | 450 |
| 2005-07-19 | 444 |
| 2005-07-20 | 442.1 |
| 2005-07-21 | 441.5 |
| 2005-07-22 | 444.2 |
| 2005-07-25 | 445.3 |
| 2005-07-26 | 446 |
| 2005-07-27 | 443.9 |
| 2005-07-28 | 438.6 |
| 2005-07-29 | 435 |
| 2005-08-01 | 437 |
| 2005-08-02 | 440.7 |
| 2005-08-03 | 440.5 |
| 2005-08-04 | 439.2 |
| 2005-08-05 | 436.3 |
| 2005-08-08 | 433 |
| 2005-08-09 | 436 |
| 2005-08-10 | 433 |
| 2005-08-11 | 435.1 |
| 2005-08-12 | 436.2 |
| 2005-08-15 | 437.9 |
| 2005-08-16 | 441.4 |
| 2005-08-17 | 441 |
| 2005-08-18 | 442.1 |
| 2005-08-19 | 441.6 |
| 2005-08-22 | 442 |
| 2005-08-23 | 435.6 |
| 2005-08-24 | 430.5 |
| 2005-08-25 | 432.72 |
| 2005-08-26 | 431 |
| 2005-08-29 | 435.4 |
| 2005-08-30 | 432.6 |
| 2005-08-31 | 437.7 |
| 2005-09-01 | 437.1 |
| 2005-09-02 | 438.8 |
| 2005-09-05 | 438.8 |
| 2005-09-06 | 443 |
| 2005-09-07 | 444.6 |
| 2005-09-08 | 444.4 |
| 2005-09-09 | 446.1 |
| 2005-09-12 | 450.1 |
| 2005-09-13 | 451 |
| 2005-09-14 | 449.8 |
| 2005-09-15 | 450.3 |
| 2005-09-16 | 454.5 |
| 2005-09-19 | 453.6 |
| 2005-09-20 | 451.5 |
| 2005-09-21 | 448.2 |
| 2005-09-22 | 451.8 |
| 2005-09-23 | 452.4 |
| 2005-09-26 | 450.9 |
| 2005-09-27 | 450.9 |
| 2005-09-28 | 451.8 |
| 2005-09-29 | 456.4 |
| 2005-09-30 | 455.2 |
| 2005-10-03 | 455.1 |
| 2005-10-04 | 453.4 |
| 2005-10-05 | 452.7 |
| 2005-10-06 | 454.3 |
| 2005-10-07 | 454.1 |
| 2005-10-10 | 452.3 |
| 2005-10-11 | 448 |
| 2005-10-12 | 446 |
| 2005-10-13 | 447.2 |
| 2005-10-14 | 450.4 |
| 2005-10-17 | 448.1 |
| 2005-10-18 | 444.6 |
| 2005-10-19 | 448.9 |
| 2005-10-20 | 443.4 |
| 2005-10-21 | 443.1 |
| 2005-10-24 | 450.5 |
| 2005-10-25 | 451.7 |
| 2005-10-26 | 456.5 |
| 2005-10-27 | 454.1 |
| 2005-10-28 | 459 |
| 2005-10-31 | 457.8 |
| 2005-11-01 | 454 |
| 2005-11-02 | 455.5 |
| 2005-11-03 | 454.5 |
| 2005-11-04 | 456 |
| 2005-11-07 | 464.3 |
| 2005-11-08 | 466 |
| 2005-11-09 | 468.2 |
| 2005-11-10 | 477.3 |
| 2005-11-11 | 480 |
| 2005-11-14 | 482.4 |
| 2005-11-15 | 476.6 |
| 2005-11-16 | 476.9 |
| 2005-11-17 | 479.4 |
| 2005-11-18 | 484.1 |
| 2005-11-21 | 485.1 |
| 2005-11-22 | 489.2 |
| 2005-11-23 | 493.4 |
| 2005-11-24 | 493.4 |
| 2005-11-25 | 495.2 |
| 2005-11-28 | 493 |
| 2005-11-29 | 490.9 |
| 2005-11-30 | 485.5 |
| 2005-12-01 | 488.5 |
| 2005-12-02 | 487.7 |
| 2005-12-05 | 488.5 |
| 2005-12-06 | 488.9 |
| 2005-12-07 | 487 |
| 2005-12-08 | 485 |
| 2005-12-09 | 489.1 |
| 2005-12-12 | 486.8 |
| 2005-12-13 | 494.4 |
| 2005-12-14 | 496.4 |
| 2005-12-15 | 491 |
| 2005-12-16 | 493.7 |
| 2005-12-19 | 491.7 |
| 2005-12-20 | 492.1 |
| 2005-12-21 | 492.7 |
| 2005-12-22 | 491.9 |
| 2005-12-23 | 492.4 |
| 2005-12-26 | 492.4 |
| 2005-12-27 | 486.5 |
| 2005-12-28 | 484.7 |
| 2005-12-29 | 485.8 |
| 2005-12-30 | 485.3 |
| 2006-01-02 | 485.3 |
| 2006-01-03 | 492.9 |
| 2006-01-04 | 483.8 |
| 2006-01-05 | 486.2 |
| 2006-01-06 | 486.2 |
| 2006-01-09 | 483.9 |
| 2006-01-10 | 485.4 |
| 2006-01-11 | 489.8 |
| 2006-01-12 | 490.3 |
| 2006-01-13 | 489.2 |
| 2006-01-16 | 489.2 |
| 2006-01-17 | 484.3 |
| 2006-01-18 | 483.6 |
| 2006-01-19 | 479.4 |
| 2006-01-20 | 456.9 |
| 2006-01-23 | 460 |
| 2006-01-24 | 460.1 |
| 2006-01-25 | 462.3 |
| 2006-01-26 | 470.1 |
| 2006-01-27 | 468.7 |
| 2006-01-30 | 468.2 |
| 2006-01-31 | 465.8 |
| 2006-02-01 | 463.3 |
| 2006-02-02 | 451.8 |
| 2006-02-03 | 450.6 |
| 2006-02-06 | 451.7 |
| 2006-02-07 | 450.5 |
| 2006-02-08 | 453.6 |
| 2006-02-09 | 457.9 |
| 2006-02-10 | 459.6 |
| 2006-02-13 | 456.8 |
| 2006-02-14 | 461.2 |
| 2006-02-15 | 462.5 |
| 2006-02-16 | 464.4 |
| 2006-02-17 | 462.4 |
| 2006-02-20 | 462.4 |
| 2006-02-21 | 461.7 |
| 2006-02-22 | 468.8 |
| 2006-02-23 | 468 |
| 2006-02-24 | 468.5 |
| 2006-02-27 | 467.8 |
| 2006-02-28 | 463.7 |
| 2006-03-01 | 466.5 |
| 2006-03-02 | 460.5 |
| 2006-03-03 | 459.2 |
| 2006-03-06 | 460.9 |
| 2006-03-07 | 464 |
| 2006-03-08 | 466.8 |
| 2006-03-09 | 464.9 |
| 2006-03-10 | 469.9 |
| 2006-03-13 | 468.4 |
| 2006-03-14 | 471.8 |
| 2006-03-15 | 470.1 |
| 2006-03-16 | 473.2 |
| 2006-03-17 | 474.1 |
| 2006-03-20 | 474 |
| 2006-03-21 | 472.2 |
| 2006-03-22 | 476.7 |
| 2006-03-23 | 477.7 |
| 2006-03-24 | 478.1 |
| 2006-03-27 | 476.4 |
| 2006-03-28 | 476 |
| 2006-03-29 | 476.3 |
| 2006-03-30 | 472.8 |
| 2006-03-31 | 472.3 |
| 2006-04-03 | 474.1 |
| 2006-04-04 | 482.1 |
| 2006-04-05 | 482.6 |
| 2006-04-06 | 478.5 |
| 2006-04-07 | 476.6 |
| 2006-04-10 | 479.3 |
| 2006-04-11 | 474.7 |
| 2006-04-12 | 476 |
| 2006-04-13 | 480.5 |
| 2006-04-14 | 480.5 |
| 2006-04-17 | 483.5 |
| 2006-04-18 | 484.8 |
| 2006-04-19 | 482.3 |
| 2006-04-20 | 483 |
| 2006-04-21 | 480.1 |
| 2006-04-24 | 480 |
| 2006-04-25 | 474.6 |
| 2006-04-26 | 477.5 |
| 2006-04-27 | 481.5 |
| 2006-04-28 | 499.5 |
| 2006-05-01 | 494.6 |
| 2006-05-02 | 496 |
| 2006-05-03 | 498.5 |
| 2006-05-04 | 493.8 |
| 2006-05-05 | 503.7 |
| 2006-05-08 | 501.6 |
| 2006-05-09 | 503.5 |
| 2006-05-10 | 503 |
| 2006-05-11 | 494.8 |
| 2006-05-12 | 489.9 |
| 2006-05-15 | 495.1 |
| 2006-05-16 | 495.4 |
| 2006-05-17 | 488.3 |
| 2006-05-18 | 487.3 |
| 2006-05-19 | 488 |
| 2006-05-22 | 488.4 |
| 2006-05-23 | 485.3 |
| 2006-05-24 | 486.6 |
| 2006-05-25 | 490.7 |
| 2006-05-26 | 495.7 |
| 2006-05-29 | 495.7 |
| 2006-05-30 | 490.2 |
| 2006-05-31 | 493 |
| 2006-06-01 | 498.3 |
| 2006-06-02 | 501.4 |
| 2006-06-05 | 496.2 |
| 2006-06-06 | 497.6 |
| 2006-06-07 | 499.5 |
| 2006-06-08 | 499.5 |
| 2006-06-09 | 497.7 |
| 2006-06-12 | 493.3 |
| 2006-06-13 | 482.1 |
| 2006-06-14 | 478 |
| 2006-06-15 | 486.8 |
| 2006-06-16 | 483.6 |
| 2006-06-19 | 478.2 |
| 2006-06-20 | 480.1 |
| 2006-06-21 | 483.7 |
| 2006-06-22 | 481.7 |
| 2006-06-23 | 477.4 |
| 2006-06-26 | 483 |
| 2006-06-27 | 477.6 |
| 2006-06-28 | 478.5 |
| 2006-06-29 | 488.6 |
| 2006-06-30 | 482.5 |
| 2006-07-03 | 489.7 |
| 2006-07-04 | 489.7 |
| 2006-07-05 | 490.1 |
| 2006-07-06 | 492.7 |
| 2006-07-07 | 490.8 |
| 2006-07-10 | 493.4 |
| 2006-07-11 | 496 |
| 2006-07-12 | 488.3 |
| 2006-07-13 | 478.7 |
| 2006-07-14 | 475.8 |
| 2006-07-17 | 464 |
| 2006-07-18 | 465.5 |
| 2006-07-19 | 472.5 |
| 2006-07-20 | 471.1 |
| 2006-07-21 | 469.3 |
| 2006-07-24 | 474.6 |
| 2006-07-25 | 474.5 |
| 2006-07-26 | 475.3 |
| 2006-07-27 | 473.1 |
| 2006-07-28 | 483.3 |
| 2006-07-31 | 483.1 |
| 2006-08-01 | 485.1 |
| 2006-08-02 | 487.2 |
| 2006-08-03 | 484.7 |
| 2006-08-04 | 485 |
| 2006-08-07 | 482.3 |
| 2006-08-08 | 483.1 |
| 2006-08-09 | 478.3 |
| 2006-08-10 | 479.7 |
| 2006-08-11 | 476.4 |
| 2006-08-14 | 477.2 |
| 2006-08-15 | 484.1 |
| 2006-08-16 | 485.3 |
| 2006-08-17 | 485.7 |
| 2006-08-18 | 486 |
| 2006-08-21 | 484.9 |
| 2006-08-22 | 484.2 |
| 2006-08-23 | 485.8 |
| 2006-08-24 | 487.2 |
| 2006-08-25 | 486.4 |
| 2006-08-28 | 491.2 |
| 2006-08-29 | 492.6 |
| 2006-08-30 | 495.2 |
| 2006-08-31 | 493.5 |
| 2006-09-01 | 493.7 |
| 2006-09-04 | 493.7 |
| 2006-09-05 | 494.2 |
| 2006-09-06 | 491.3 |
| 2006-09-07 | 485.5 |
| 2006-09-08 | 487.2 |
| 2006-09-11 | 489.2 |
| 2006-09-12 | 489.9 |
| 2006-09-13 | 493 |
| 2006-09-14 | 492.9 |
| 2006-09-15 | 491.9 |
| 2006-09-18 | 495.9 |
| 2006-09-19 | 497 |
| 2006-09-20 | 499 |
| 2006-09-21 | 497.5 |
| 2006-09-22 | 495 |
| 2006-09-25 | 500.8 |
| 2006-09-26 | 502.3 |
| 2006-09-27 | 499.7 |
| 2006-09-28 | 499.3 |
| 2006-09-29 | 496.7 |
| 2006-10-02 | 494.9 |
| 2006-10-03 | 500.9 |
| 2006-10-04 | 510.3 |
| 2006-10-05 | 509.9 |
| 2006-10-06 | 510.5 |
| 2006-10-09 | 510.8 |
| 2006-10-10 | 508.2 |
| 2006-10-11 | 503.8 |
| 2006-10-12 | 501.8 |
| 2006-10-13 | 503.8 |
| 2006-10-16 | 501.5 |
| 2006-10-17 | 500.5 |
| 2006-10-18 | 501.9 |
| 2006-10-19 | 498.7 |
| 2006-10-20 | 499.1 |
| 2006-10-23 | 506.2 |
| 2006-10-24 | 504.7 |
| 2006-10-25 | 508.7 |
| 2006-10-26 | 508.3 |
| 2006-10-27 | 503.6 |
| 2006-10-30 | 501.2 |
| 2006-10-31 | 501.6 |
| 2006-11-01 | 500.9 |
| 2006-11-02 | 497.4 |
| 2006-11-03 | 495.9 |
| 2006-11-06 | 502.2 |
| 2006-11-07 | 504.8 |
| 2006-11-08 | 505.7 |
| 2006-11-09 | 506.1 |
| 2006-11-10 | 506.3 |
| 2006-11-13 | 506.9 |
| 2006-11-14 | 507.5 |
| 2006-11-15 | 504.7 |
| 2006-11-16 | 506.6 |
| 2006-11-17 | 508 |
| 2006-11-20 | 507.3 |
| 2006-11-21 | 506.1 |
| 2006-11-22 | 507.7 |
| 2006-11-23 | 507.7 |
| 2006-11-24 | 503.1 |
| 2006-11-27 | 498.9 |
| 2006-11-28 | 495.6 |
| 2006-11-29 | 498.6 |
| 2006-11-30 | 495.9 |
| 2006-12-01 | 493.8 |
| 2006-12-04 | 500 |
| 2006-12-05 | 505.1 |
| 2006-12-06 | 507.8 |
| 2006-12-07 | 507.1 |
| 2006-12-08 | 518.5 |
| 2006-12-11 | 528.8 |
| 2006-12-12 | 522.5 |
| 2006-12-13 | 523.2 |
| 2006-12-14 | 531.1 |
| 2006-12-15 | 540.7 |
| 2006-12-18 | 554.4 |
| 2006-12-19 | 552.3 |
| 2006-12-20 | 551.6 |
| 2006-12-21 | 547.6 |
| 2006-12-22 | 545.5 |
| 2006-12-25 | 545.5 |
| 2006-12-26 | 551.2 |
| 2006-12-27 | 564.1 |
| 2006-12-28 | 558.8 |
| 2006-12-29 | 557 |
| 2007-01-01 | 557 |
| 2007-01-02 | 557 |
| 2007-01-03 | 552.5 |
| 2007-01-04 | 550.6 |
| 2007-01-05 | 547.7 |
| 2007-01-08 | 550.5 |
| 2007-01-09 | 545.7 |
| 2007-01-10 | 541.3 |
| 2007-01-11 | 541.7 |
| 2007-01-12 | 543.8 |
| 2007-01-15 | 543.8 |
| 2007-01-16 | 547.7 |
| 2007-01-17 | 543.9 |
| 2007-01-18 | 543.9 |
| 2007-01-19 | 545 |
| 2007-01-22 | 546.8 |
| 2007-01-23 | 544.9 |
| 2007-01-24 | 548.4 |
| 2007-01-25 | 539.3 |
| 2007-01-26 | 546.7 |
| 2007-01-29 | 540.6 |
| 2007-01-30 | 542.7 |
| 2007-01-31 | 551.3 |
| 2007-02-01 | 547.3 |
| 2007-02-02 | 546.6 |
| 2007-02-05 | 547.5 |
| 2007-02-06 | 549.5 |
| 2007-02-07 | 551.9 |
| 2007-02-08 | 544.4 |
| 2007-02-09 | 534 |
| 2007-02-12 | 534.3 |
| 2007-02-13 | 537.1 |
| 2007-02-14 | 541.8 |
| 2007-02-15 | 542.1 |
| 2007-02-16 | 541 |
| 2007-02-19 | 541 |
| 2007-02-20 | 541.9 |
| 2007-02-21 | 537.5 |
| 2007-02-22 | 535.9 |
| 2007-02-23 | 537.7 |
| 2007-02-26 | 526.8 |
| 2007-02-27 | 506.1 |
| 2007-02-28 | 503.7 |
| 2007-03-01 | 510.8 |
| 2007-03-02 | 499.7 |
| 2007-03-05 | 492.5 |
| 2007-03-06 | 505.8 |
| 2007-03-07 | 502.2 |
| 2007-03-08 | 505 |
| 2007-03-09 | 503.3 |
| 2007-03-12 | 503.6 |
| 2007-03-13 | 487.5 |
| 2007-03-14 | 490.8 |
| 2007-03-15 | 501.3 |
| 2007-03-16 | 495.3 |
| 2007-03-19 | 500.6 |
| 2007-03-20 | 506.4 |
| 2007-03-21 | 520.3 |
| 2007-03-22 | 518.4 |
| 2007-03-23 | 517.2 |
| 2007-03-26 | 515.4 |
| 2007-03-27 | 510.6 |
| 2007-03-28 | 509.6 |
| 2007-03-29 | 514 |
| 2007-03-30 | 513.4 |
| 2007-04-02 | 513.4 |
| 2007-04-03 | 514.1 |
| 2007-04-04 | 513.6 |
| 2007-04-05 | 515.7 |
| 2007-04-06 | 515.7 |
| 2007-04-09 | 515.8 |
| 2007-04-10 | 524 |
| 2007-04-11 | 518 |
| 2007-04-12 | 516.5 |
| 2007-04-13 | 516 |
| 2007-04-16 | 529.3 |
| 2007-04-17 | 525.3 |
| 2007-04-18 | 529.9 |
| 2007-04-19 | 530.9 |
| 2007-04-20 | 534.2 |
| 2007-04-23 | 531.1 |
| 2007-04-24 | 528.1 |
| 2007-04-25 | 538 |
| 2007-04-26 | 535.6 |
| 2007-04-27 | 533.7 |
| 2007-04-30 | 536.2 |
| 2007-05-01 | 542 |
| 2007-05-02 | 543 |
| 2007-05-03 | 539.5 |
| 2007-05-04 | 540.9 |
| 2007-05-07 | 538.8 |
| 2007-05-08 | 537.2 |
| 2007-05-09 | 541.2 |
| 2007-05-10 | 532 |
| 2007-05-11 | 531.1 |
| 2007-05-14 | 528.6 |
| 2007-05-15 | 527.9 |
| 2007-05-16 | 549.1 |
| 2007-05-17 | 548 |
| 2007-05-18 | 550 |
| 2007-05-21 | 548.4 |
| 2007-05-22 | 550.8 |
| 2007-05-23 | 550.1 |
| 2007-05-24 | 549.3 |
| 2007-05-25 | 551.2 |
| 2007-05-28 | 551.2 |
| 2007-05-29 | 549.1 |
| 2007-05-30 | 552 |
| 2007-05-31 | 544.9 |
| 2007-06-01 | 545.1 |
| 2007-06-04 | 541.5 |
| 2007-06-05 | 539 |
| 2007-06-06 | 533.3 |
| 2007-06-07 | 525.2 |
| 2007-06-08 | 533.3 |
| 2007-06-11 | 534.7 |
| 2007-06-12 | 526 |
| 2007-06-13 | 536.8 |
| 2007-06-14 | 536.7 |
| 2007-06-15 | 539.8 |
| 2007-06-18 | 539.6 |
| 2007-06-19 | 542.6 |
| 2007-06-20 | 534.4 |
| 2007-06-21 | 536.6 |
| 2007-06-22 | 524.1 |
| 2007-06-25 | 516.9 |
| 2007-06-26 | 511.5 |
| 2007-06-27 | 518.1 |
| 2007-06-28 | 518.1 |
| 2007-06-29 | 512.9 |
| 2007-07-02 | 516.4 |
| 2007-07-03 | 518.6 |
| 2007-07-04 | 518.6 |
| 2007-07-05 | 517 |
| 2007-07-06 | 517 |
| 2007-07-09 | 516 |
| 2007-07-10 | 510 |
| 2007-07-11 | 514.1 |
| 2007-07-12 | 528.4 |
| 2007-07-13 | 525.2 |
| 2007-07-16 | 521.9 |
| 2007-07-17 | 524.6 |
| 2007-07-18 | 516 |
| 2007-07-19 | 511.3 |
| 2007-07-20 | 507.3 |
| 2007-07-23 | 508.6 |
| 2007-07-24 | 493.1 |
| 2007-07-25 | 492.12 |
| 2007-07-26 | 478.1 |
| 2007-07-27 | 469.7 |
| 2007-07-30 | 471.9 |
| 2007-07-31 | 465.7 |
| 2007-08-01 | 468.5 |
| 2007-08-02 | 472.4 |
| 2007-08-03 | 457.2 |
| 2007-08-06 | 483.5 |
| 2007-08-07 | 485.9 |
| 2007-08-08 | 494.9 |
| 2007-08-09 | 469 |
| 2007-08-10 | 470 |
| 2007-08-13 | 465.4 |
| 2007-08-14 | 456.6 |
| 2007-08-15 | 456.1 |
| 2007-08-16 | 475.5 |
| 2007-08-17 | 488.1 |
| 2007-08-20 | 483.9 |
| 2007-08-21 | 480.6 |
| 2007-08-22 | 484.3 |
| 2007-08-23 | 483.5 |
| 2007-08-24 | 485 |
| 2007-08-27 | 477.9 |
| 2007-08-28 | 461.4 |
| 2007-08-29 | 469.5 |
| 2007-08-30 | 462.3 |
| 2007-08-31 | 468.8 |
| 2007-09-03 | 468.8 |
| 2007-09-04 | 472.1 |
| 2007-09-05 | 460 |
| 2007-09-06 | 456.6 |
| 2007-09-07 | 454.8 |
| 2007-09-10 | 453 |
| 2007-09-11 | 460.1 |
| 2007-09-12 | 457.6 |
| 2007-09-13 | 463.6 |
| 2007-09-14 | 466.4 |
| 2007-09-17 | 460.3 |
| 2007-09-18 | 483.7 |
| 2007-09-19 | 482.7 |
| 2007-09-20 | 472 |
| 2007-09-21 | 475.1 |
| 2007-09-24 | 465.9 |
| 2007-09-25 | 463.1 |
| 2007-09-26 | 465.5 |
| 2007-09-27 | 468.8 |
| 2007-09-28 | 466.7 |
| 2007-10-01 | 477.2 |
| 2007-10-02 | 478.6 |
| 2007-10-03 | 478.9 |
| 2007-10-04 | 476.3 |
| 2007-10-05 | 483 |
| 2007-10-08 | 478 |
| 2007-10-09 | 476.2 |
| 2007-10-10 | 471.4 |
| 2007-10-11 | 483.2 |
| 2007-10-12 | 478.7 |
| 2007-10-15 | 462.4 |
| 2007-10-16 | 447.9 |
| 2007-10-17 | 446.6 |
| 2007-10-18 | 438.3 |
| 2007-10-19 | 423.6 |
| 2007-10-22 | 426.1 |
| 2007-10-23 | 424.4 |
| 2007-10-24 | 418.2 |
| 2007-10-25 | 412.3 |
| 2007-10-26 | 426.3 |
| 2007-10-29 | 426.9 |
| 2007-10-30 | 421.1 |
| 2007-10-31 | 419 |
| 2007-11-01 | 385.1 |
| 2007-11-02 | 377.3 |
| 2007-11-05 | 359 |
| 2007-11-06 | 351 |
| 2007-11-07 | 334.1 |
| 2007-11-08 | 329 |
| 2007-11-09 | 331 |
| 2007-11-12 | 335.7 |
| 2007-11-13 | 359 |
| 2007-11-14 | 360.4 |
| 2007-11-15 | 345.8 |
| 2007-11-16 | 340 |
| 2007-11-19 | 320 |
| 2007-11-20 | 314 |
| 2007-11-21 | 307.3 |
| 2007-11-22 | 307.3 |
| 2007-11-23 | 317 |
| 2007-11-26 | 307 |
| 2007-11-27 | 303.2 |
| 2007-11-28 | 322.9 |
| 2007-11-29 | 322.9 |
| 2007-11-30 | 333 |
| 2007-12-03 | 330.6 |
| 2007-12-04 | 325.5 |
| 2007-12-05 | 336.9 |
| 2007-12-06 | 343.5 |
| 2007-12-07 | 343.1 |
| 2007-12-10 | 347.7 |
| 2007-12-11 | 332.3 |
| 2007-12-12 | 314.7 |
| 2007-12-13 | 310.1 |
| 2007-12-14 | 307 |
| 2007-12-17 | 307.7 |
| 2007-12-18 | 303.8 |
| 2007-12-19 | 302.1 |
| 2007-12-20 | 298.9 |
| 2007-12-21 | 302.4 |
| 2007-12-24 | 309.8 |
| 2007-12-25 | 309.8 |
| 2007-12-26 | 304.5 |
| 2007-12-27 | 295.6 |
| 2007-12-28 | 292.9 |
| 2007-12-31 | 294.4 |
| 2008-01-01 | 294.4 |
| 2008-01-02 | 289.2 |
| 2008-01-03 | 289.3 |
| 2008-01-04 | 282.4 |
| 2008-01-07 | 282.6 |
| 2008-01-08 | 271.4 |
| 2008-01-09 | 274.9 |
| 2008-01-10 | 281.1 |
| 2008-01-11 | 285.6 |
| 2008-01-14 | 290.6 |
| 2008-01-15 | 269.4 |
| 2008-01-16 | 262.4 |
| 2008-01-17 | 249.6 |
| 2008-01-18 | 244.5 |
| 2008-01-21 | 244.5 |
| 2008-01-22 | 244 |
| 2008-01-23 | 263.6 |
| 2008-01-24 | 273.3 |
| 2008-01-25 | 266.4 |
| 2008-01-28 | 276.72 |
| 2008-01-29 | 279.1 |
| 2008-01-30 | 278.8 |
| 2008-01-31 | 281.7 |
| 2008-02-01 | 296.9 |
| 2008-02-04 | 292.2 |
| 2008-02-05 | 270.5 |
| 2008-02-06 | 269.2 |
| 2008-02-07 | 267 |
| 2008-02-08 | 260.3 |
| 2008-02-11 | 258.1 |
| 2008-02-12 | 262.1 |
| 2008-02-13 | 263.4 |
| 2008-02-14 | 257.4 |
| 2008-02-15 | 254.8 |
| 2008-02-18 | 254.8 |
| 2008-02-19 | 253.2 |
| 2008-02-20 | 254.9 |
| 2008-02-21 | 250.5 |
| 2008-02-22 | 251.2 |
| 2008-02-25 | 247.4 |
| 2008-02-26 | 249.5 |
| 2008-02-27 | 257.2 |
| 2008-02-28 | 250.1 |
| 2008-02-29 | 237.1 |
| 2008-03-03 | 230.9 |
| 2008-03-04 | 221 |
| 2008-03-05 | 221.5 |
| 2008-03-06 | 211.7 |
| 2008-03-07 | 209.1 |
| 2008-03-10 | 196.9 |
| 2008-03-11 | 215.6 |
| 2008-03-12 | 212.1 |
| 2008-03-13 | 210.7 |
| 2008-03-14 | 197.8 |
| 2008-03-17 | 186.2 |
| 2008-03-18 | 207.1 |
| 2008-03-19 | 204.1 |
| 2008-03-20 | 225 |
| 2008-03-21 | 225 |
| 2008-03-24 | 232.7 |
| 2008-03-25 | 234.2 |
| 2008-03-26 | 220.5 |
| 2008-03-27 | 217.9 |
| 2008-03-28 | 208.3 |
| 2008-03-31 | 214.2 |
| 2008-04-01 | 238.4 |
| 2008-04-02 | 240.2 |
| 2008-04-03 | 243.6 |
| 2008-04-04 | 240.8 |
| 2008-04-07 | 246 |
| 2008-04-08 | 237.6 |
| 2008-04-09 | 235.8 |
| 2008-04-10 | 237.1 |
| 2008-04-11 | 233.6 |
| 2008-04-14 | 225.1 |
| 2008-04-15 | 228 |
| 2008-04-16 | 234.4 |
| 2008-04-17 | 240.3 |
| 2008-04-18 | 251.1 |
| 2008-04-21 | 250.3 |
| 2008-04-22 | 251.2 |
| 2008-04-23 | 246.3 |
| 2008-04-24 | 257.6 |
| 2008-04-25 | 266 |
| 2008-04-28 | 268.1 |
| 2008-04-29 | 263.2 |
| 2008-04-30 | 252.7 |
| 2008-05-01 | 259.9 |
| 2008-05-02 | 263.9 |
| 2008-05-05 | 257.5 |
| 2008-05-06 | 258.7 |
| 2008-05-07 | 244.8 |
| 2008-05-08 | 241 |
| 2008-05-09 | 236.3 |
| 2008-05-12 | 236.4 |
| 2008-05-13 | 230.3 |
| 2008-05-14 | 232.5 |
| 2008-05-15 | 237.3 |
| 2008-05-16 | 231.2 |
| 2008-05-19 | 229.9 |
| 2008-05-20 | 221.1 |
| 2008-05-21 | 210.6 |
| 2008-05-22 | 217.2 |
| 2008-05-23 | 211.2 |
| 2008-05-26 | 211.2 |
| 2008-05-27 | 216.6 |
| 2008-05-28 | 216 |
| 2008-05-29 | 220.4 |
| 2008-05-30 | 218.9 |
| 2008-06-02 | 214.6 |
| 2008-06-03 | 214.2 |
| 2008-06-04 | 210.8 |
| 2008-06-05 | 212.2 |
| 2008-06-06 | 200.6 |
| 2008-06-09 | 196 |
| 2008-06-10 | 202.6 |
| 2008-06-11 | 192.1 |
| 2008-06-12 | 198.9 |
| 2008-06-13 | 204.8 |
| 2008-06-16 | 208.3 |
| 2008-06-17 | 204.6 |
| 2008-06-18 | 204 |
| 2008-06-19 | 201.7 |
| 2008-06-20 | 193 |
| 2008-06-23 | 185.5 |
| 2008-06-24 | 188.5 |
| 2008-06-25 | 188.5 |
| 2008-06-26 | 176.7 |
| 2008-06-27 | 172.5 |
| 2008-06-30 | 167.6 |
| 2008-07-01 | 171.3 |
| 2008-07-02 | 168.4 |
| 2008-07-03 | 168.2 |
| 2008-07-04 | 168.2 |
| 2008-07-07 | 164 |
| 2008-07-08 | 173.9 |
| 2008-07-09 | 164.4 |
| 2008-07-10 | 162.8 |
| 2008-07-11 | 161.9 |
| 2008-07-14 | 152.2 |
| 2008-07-15 | 145.6 |
| 2008-07-16 | 164.7 |
| 2008-07-17 | 179.7 |
| 2008-07-18 | 193.5 |
| 2008-07-21 | 196.9 |
| 2008-07-22 | 208.9 |
| 2008-07-23 | 211.2 |
| 2008-07-24 | 190.6 |
| 2008-07-25 | 188.5 |
| 2008-07-28 | 174.3 |
| 2008-07-29 | 184.5 |
| 2008-07-30 | 188.1 |
| 2008-07-31 | 186.9 |
| 2008-08-01 | 188.7 |
| 2008-08-04 | 188.3 |
| 2008-08-05 | 199.2 |
| 2008-08-06 | 197 |
| 2008-08-07 | 184.7 |
| 2008-08-08 | 193.9 |
| 2008-08-11 | 198.2 |
| 2008-08-12 | 185.4 |
| 2008-08-13 | 178.1 |
| 2008-08-14 | 180.8 |
| 2008-08-15 | 185.5 |
| 2008-08-18 | 176.2 |
| 2008-08-19 | 171.9 |
| 2008-08-20 | 174.9 |
| 2008-08-21 | 174.7 |
| 2008-08-22 | 181.4 |
| 2008-08-25 | 176.1 |
| 2008-08-26 | 178.4 |
| 2008-08-27 | 181.2 |
| 2008-08-28 | 190.8 |
| 2008-08-29 | 189.9 |
| 2008-09-01 | 189.9 |
| 2008-09-02 | 191.1 |
| 2008-09-03 | 196.1 |
| 2008-09-04 | 183 |
| 2008-09-05 | 190.7 |
| 2008-09-08 | 203.2 |
| 2008-09-09 | 188.8 |
| 2008-09-10 | 186.8 |
| 2008-09-11 | 186.1 |
| 2008-09-12 | 179.6 |
| 2008-09-15 | 152.4 |
| 2008-09-16 | 157.5 |
| 2008-09-17 | 140.3 |
| 2008-09-18 | 166.5 |
| 2008-09-19 | 206.5 |
| 2008-09-22 | 200.1 |
| 2008-09-23 | 199.9 |
| 2008-09-24 | 189.6 |
| 2008-09-25 | 194.1 |
| 2008-09-26 | 201.5 |
| 2008-09-29 | 177.5 |
| 2008-09-30 | 205.1 |
| 2008-10-01 | 230 |
| 2008-10-02 | 225 |
| 2008-10-03 | 183.5 |
| 2008-10-06 | 174.1 |
| 2008-10-07 | 151.5 |
| 2008-10-08 | 144 |
| 2008-10-09 | 129.3 |
| 2008-10-10 | 141.1 |
| 2008-10-13 | 157.5 |
| 2008-10-14 | 186.2 |
| 2008-10-15 | 162.3 |
| 2008-10-16 | 159 |
| 2008-10-17 | 148.8 |
| 2008-10-20 | 150.9 |
| 2008-10-21 | 141.8 |
| 2008-10-22 | 133.2 |
| 2008-10-23 | 131.1 |
| 2008-10-24 | 121.4 |
| 2008-10-27 | 117.3 |
| 2008-10-28 | 134.7 |
| 2008-10-29 | 129.1 |
| 2008-10-30 | 131.1 |
| 2008-10-31 | 136.5 |
| 2008-11-03 | 139.9 |
| 2008-11-04 | 146.8 |
| 2008-11-05 | 126.3 |
| 2008-11-06 | 115.2 |
| 2008-11-07 | 118.2 |
| 2008-11-10 | 112.1 |
| 2008-11-11 | 108 |
| 2008-11-12 | 96.4 |
| 2008-11-13 | 94.5 |
| 2008-11-14 | 95.2 |
| 2008-11-17 | 88.9 |
| 2008-11-18 | 83.6 |
| 2008-11-19 | 64 |
| 2008-11-20 | 47.1 |
| 2008-11-21 | 37.7 |
| 2008-11-24 | 59.5 |
| 2008-11-25 | 60.8 |
| 2008-11-26 | 70.5 |
| 2008-11-27 | 70.5 |
| 2008-11-28 | 82.9 |
| 2008-12-01 | 64.5 |
| 2008-12-02 | 72.2 |
| 2008-12-03 | 78.2 |
| 2008-12-04 | 74 |
| 2008-12-05 | 77.1 |
| 2008-12-08 | 84.7 |
| 2008-12-09 | 85.4 |
| 2008-12-10 | 83 |
| 2008-12-11 | 75.7 |
| 2008-12-12 | 77 |
| 2008-12-15 | 74 |
| 2008-12-16 | 82.3 |
| 2008-12-17 | 78.3 |
| 2008-12-18 | 74.3 |
| 2008-12-19 | 70.2 |
| 2008-12-22 | 67.5 |
| 2008-12-23 | 65.2 |
| 2008-12-24 | 67.8 |
| 2008-12-25 | 67.8 |
| 2008-12-26 | 67.3 |
| 2008-12-29 | 65.7 |
| 2008-12-30 | 68 |
| 2008-12-31 | 67.1 |
| 2009-01-01 | 67.1 |
| 2009-01-02 | 71.4 |
| 2009-01-05 | 70.8 |
| 2009-01-06 | 74.6 |
| 2009-01-07 | 71.5 |
| 2009-01-08 | 71.6 |
| 2009-01-09 | 67.5 |
| 2009-01-12 | 56 |
| 2009-01-13 | 59 |
| 2009-01-14 | 45.3 |
| 2009-01-15 | 38.3 |
| 2009-01-16 | 35 |
| 2009-01-19 | 35 |
| 2009-01-20 | 28 |
| 2009-01-21 | 36.7 |
| 2009-01-22 | 31.1 |
| 2009-01-23 | 34.7 |
| 2009-01-26 | 33.3 |
| 2009-01-27 | 35.5 |
| 2009-01-28 | 42.1 |
| 2009-01-29 | 39 |
| 2009-01-30 | 35.5 |
| 2009-02-02 | 36.5 |
| 2009-02-03 | 34.6 |
| 2009-02-04 | 34.9 |
| 2009-02-05 | 35.3 |
| 2009-02-06 | 39.1 |
| 2009-02-09 | 39.5 |
| 2009-02-10 | 33.5 |
| 2009-02-11 | 36.9 |
| 2009-02-12 | 36.1 |
| 2009-02-13 | 34.9 |
| 2009-02-16 | 34.9 |
| 2009-02-17 | 30.6 |
| 2009-02-18 | 29.1 |
| 2009-02-19 | 25.1 |
| 2009-02-20 | 19.5 |
| 2009-02-23 | 21.4 |
| 2009-02-24 | 26 |
| 2009-02-25 | 25.2 |
| 2009-02-26 | 24.6 |
| 2009-02-27 | 15 |
| 2009-03-02 | 12 |
| 2009-03-03 | 12.2 |
| 2009-03-04 | 11.3 |
| 2009-03-05 | 10.2 |
| 2009-03-06 | 10.3 |
| 2009-03-09 | 10.5 |
| 2009-03-10 | 14.5 |
| 2009-03-11 | 15.4 |
| 2009-03-12 | 16.7 |
| 2009-03-13 | 17.8 |
| 2009-03-16 | 23.3 |
| 2009-03-17 | 25.1 |
| 2009-03-18 | 30.8 |
| 2009-03-19 | 26 |
| 2009-03-20 | 26.2 |
| 2009-03-23 | 31.3 |
| 2009-03-24 | 30.1 |
| 2009-03-25 | 29.5 |
| 2009-03-26 | 28.1 |
| 2009-03-27 | 26.2 |
| 2009-03-30 | 23.1 |
| 2009-03-31 | 25.3 |
| 2009-04-01 | 26.8 |
| 2009-04-02 | 27.4 |
| 2009-04-03 | 28.5 |
| 2009-04-06 | 27.2 |
| 2009-04-07 | 27.6 |
| 2009-04-08 | 27 |
| 2009-04-09 | 30.4 |
| 2009-04-10 | 30.4 |
| 2009-04-13 | 38 |
| 2009-04-14 | 40.1 |
| 2009-04-15 | 39.7 |
| 2009-04-16 | 40.1 |
| 2009-04-17 | 36.5 |
| 2009-04-20 | 29.4 |
| 2009-04-21 | 32.4 |
| 2009-04-22 | 32.5 |
| 2009-04-23 | 32 |
| 2009-04-24 | 31.9 |
| 2009-04-27 | 30.7 |
| 2009-04-28 | 28.9 |
| 2009-04-29 | 31.2 |
| 2009-04-30 | 30.5 |
| 2009-05-01 | 29.7 |
| 2009-05-04 | 32 |
| 2009-05-05 | 33.1 |
| 2009-05-06 | 38.6 |
| 2009-05-07 | 38.1 |
| 2009-05-08 | 40.2 |
| 2009-05-11 | 38.6 |
| 2009-05-12 | 36.6 |
| 2009-05-13 | 34.1 |
| 2009-05-14 | 35.5 |
| 2009-05-15 | 34.8 |
| 2009-05-18 | 36.4 |
| 2009-05-19 | 37.7 |
| 2009-05-20 | 36.9 |
| 2009-05-21 | 37.2 |
| 2009-05-22 | 36.7 |
| 2009-05-25 | 36.7 |
| 2009-05-26 | 37.7 |
| 2009-05-27 | 37 |
| 2009-05-28 | 36.7 |
| 2009-05-29 | 37.2 |
| 2009-06-01 | 36.9 |
| 2009-06-02 | 35.1 |
| 2009-06-03 | 33.9 |
| 2009-06-04 | 35.7 |
| 2009-06-05 | 34.6 |
| 2009-06-08 | 34.2 |
| 2009-06-09 | 34.1 |
| 2009-06-10 | 34.8 |
| 2009-06-11 | 34.8 |
| 2009-06-12 | 34.7 |
| 2009-06-15 | 33.7 |
| 2009-06-16 | 32.5 |
| 2009-06-17 | 30.8 |
| 2009-06-18 | 31.3 |
| 2009-06-19 | 31.7 |
| 2009-06-22 | 30 |
| 2009-06-23 | 30.1 |
| 2009-06-24 | 30.4 |
| 2009-06-25 | 30.3 |
| 2009-06-26 | 30.3 |
| 2009-06-29 | 30.2 |
| 2009-06-30 | 29.7 |
| 2009-07-01 | 29.7 |
| 2009-07-02 | 28.8 |
| 2009-07-03 | 28.8 |
| 2009-07-06 | 27.9 |
| 2009-07-07 | 26.9 |
| 2009-07-08 | 26.2 |
| 2009-07-09 | 26.9 |
| 2009-07-10 | 25.9 |
| 2009-07-13 | 27.8 |
| 2009-07-14 | 29.2 |
| 2009-07-15 | 31.7 |
| 2009-07-16 | 30.3 |
| 2009-07-17 | 30.2 |
| 2009-07-20 | 27.9 |
| 2009-07-21 | 26.5 |
| 2009-07-22 | 28 |
| 2009-07-23 | 27.7 |
| 2009-07-24 | 27.3 |
| 2009-07-27 | 26.9 |
| 2009-07-28 | 29.7 |
| 2009-07-29 | 32.2 |
| 2009-07-30 | 31.4 |
| 2009-07-31 | 31.7 |
| 2009-08-03 | 31.8 |
| 2009-08-04 | 32.5 |
| 2009-08-05 | 35.8 |
| 2009-08-06 | 38 |
| 2009-08-07 | 38.5 |
| 2009-08-10 | 39.4 |
| 2009-08-11 | 36.9 |
| 2009-08-12 | 39.8 |
| 2009-08-13 | 40.6 |
| 2009-08-14 | 40.4 |
| 2009-08-17 | 40 |
| 2009-08-18 | 41.4 |
| 2009-08-19 | 41.3 |
| 2009-08-20 | 44.8 |
| 2009-08-21 | 47 |
| 2009-08-24 | 48.2 |
| 2009-08-25 | 47.5 |
| 2009-08-26 | 46.3 |
| 2009-08-27 | 50.5 |
| 2009-08-28 | 52.3 |
| 2009-08-31 | 50 |
| 2009-09-01 | 45.4 |
| 2009-09-02 | 45.6 |
| 2009-09-03 | 47.7 |
| 2009-09-04 | 48.5 |
| 2009-09-07 | 48.5 |
| 2009-09-08 | 46.8 |
| 2009-09-09 | 46.6 |
| 2009-09-10 | 47.5 |
| 2009-09-11 | 46.1 |
| 2009-09-14 | 45.2 |
| 2009-09-15 | 41.2 |
| 2009-09-16 | 42 |
| 2009-09-17 | 44.2 |
| 2009-09-18 | 42.6 |
| 2009-09-21 | 44.3 |
| 2009-09-22 | 46.5 |
| 2009-09-23 | 45.2 |
| 2009-09-24 | 44.3 |
| 2009-09-25 | 43.8 |
| 2009-09-28 | 45.7 |
| 2009-09-29 | 47 |
| 2009-09-30 | 48.4 |
| 2009-10-01 | 45.3 |
| 2009-10-02 | 45.2 |
| 2009-10-05 | 46.7 |
| 2009-10-06 | 46.7 |
| 2009-10-07 | 46.4 |
| 2009-10-08 | 46.5 |
| 2009-10-09 | 46.3 |
| 2009-10-12 | 47.7 |
| 2009-10-13 | 48.3 |
| 2009-10-14 | 50 |
| 2009-10-15 | 47.5 |
| 2009-10-16 | 45.9 |
| 2009-10-19 | 45.4 |
| 2009-10-20 | 44.3 |
| 2009-10-21 | 44.2 |
| 2009-10-22 | 44.6 |
| 2009-10-23 | 44.6 |
| 2009-10-26 | 42.7 |
| 2009-10-27 | 42.7 |
| 2009-10-28 | 40.8 |
| 2009-10-29 | 43.1 |
| 2009-10-30 | 40.9 |
| 2009-11-02 | 39.9 |
| 2009-11-03 | 40.4 |
| 2009-11-04 | 39.7 |
| 2009-11-05 | 40.6 |
| 2009-11-06 | 40.6 |
| 2009-11-09 | 41.9 |
| 2009-11-10 | 41.8 |
| 2009-11-11 | 41.6 |
| 2009-11-12 | 40.6 |
| 2009-11-13 | 40.5 |
| 2009-11-16 | 41.8 |
| 2009-11-17 | 42.4 |
| 2009-11-18 | 42.9 |
| 2009-11-19 | 42.6 |
| 2009-11-20 | 42 |
| 2009-11-23 | 42.8 |
| 2009-11-24 | 42.1 |
| 2009-11-25 | 41.7 |
| 2009-11-26 | 41.7 |
| 2009-11-27 | 40.6 |
| 2009-11-30 | 41.1 |
| 2009-12-01 | 41 |
| 2009-12-02 | 41 |
| 2009-12-03 | 40.5 |
| 2009-12-04 | 40.6 |
| 2009-12-07 | 40.3 |
| 2009-12-08 | 39.1 |
| 2009-12-09 | 38.6 |
| 2009-12-10 | 38.7 |
| 2009-12-11 | 39.5 |
| 2009-12-14 | 37 |
| 2009-12-15 | 35.6 |
| 2009-12-16 | 34.5 |
| 2009-12-17 | 32 |
| 2009-12-18 | 34 |
| 2009-12-21 | 34.2 |
| 2009-12-22 | 33.4 |
| 2009-12-23 | 32.9 |
| 2009-12-24 | 33.5 |
| 2009-12-25 | 33.5 |
| 2009-12-28 | 33.9 |
| 2009-12-29 | 33.7 |
| 2009-12-30 | 33.2 |
| 2009-12-31 | 33.1 |
| 2010-01-01 | 33.1 |
| 2010-01-04 | 34 |
| 2010-01-05 | 35.3 |
| 2010-01-06 | 36.4 |
| 2010-01-07 | 36.5 |
| 2010-01-08 | 35.9 |
| 2010-01-11 | 36.3 |
| 2010-01-12 | 35.2 |
| 2010-01-13 | 35 |
| 2010-01-14 | 35.1 |
| 2010-01-15 | 34.2 |
| 2010-01-18 | 34.2 |
| 2010-01-19 | 35.4 |
| 2010-01-20 | 34.6 |
| 2010-01-21 | 32.7 |
| 2010-01-22 | 32.5 |
| 2010-01-25 | 32.3 |
| 2010-01-26 | 31.5 |
| 2010-01-27 | 32 |
| 2010-01-28 | 32.4 |
| 2010-01-29 | 33.2 |
| 2010-02-01 | 33.4 |
| 2010-02-02 | 34.1 |
| 2010-02-03 | 33.7 |
| 2010-02-04 | 31.8 |
| 2010-02-05 | 32.2 |
| 2010-02-08 | 31.5 |
| 2010-02-09 | 31.8 |
| 2010-02-10 | 32 |
| 2010-02-11 | 32.1 |
| 2010-02-12 | 31.8 |
| 2010-02-15 | 31.8 |
| 2010-02-16 | 33.1 |
| 2010-02-17 | 34.1 |
| 2010-02-18 | 34.3 |
| 2010-02-19 | 34.2 |
| 2010-02-22 | 34.6 |
| 2010-02-23 | 33.5 |
| 2010-02-24 | 34.5 |
| 2010-02-25 | 33.9 |
| 2010-02-26 | 34 |
| 2010-03-01 | 33.9 |
| 2010-03-02 | 34 |
| 2010-03-03 | 34 |
| 2010-03-04 | 34.3 |
| 2010-03-05 | 35 |
| 2010-03-08 | 35.6 |
| 2010-03-09 | 38.2 |
| 2010-03-10 | 39.6 |
| 2010-03-11 | 41.8 |
| 2010-03-12 | 39.7 |
| 2010-03-15 | 38.9 |
| 2010-03-16 | 40.5 |
| 2010-03-17 | 40.5 |
| 2010-03-18 | 40.2 |
| 2010-03-19 | 39 |
| 2010-03-22 | 40.4 |
| 2010-03-23 | 41.3 |
| 2010-03-24 | 41.5 |
| 2010-03-25 | 42.7 |
| 2010-03-26 | 43.1 |
| 2010-03-29 | 41.8 |
| 2010-03-30 | 40.9 |
| 2010-03-31 | 40.5 |
| 2010-04-01 | 41.8 |
| 2010-04-02 | 41.8 |
| 2010-04-05 | 42.6 |
| 2010-04-06 | 42.9 |
| 2010-04-07 | 43.6 |
| 2010-04-08 | 44.7 |
| 2010-04-09 | 45.5 |
| 2010-04-12 | 46.4 |
| 2010-04-13 | 46.2 |
| 2010-04-14 | 49.3 |
| 2010-04-15 | 48.1 |
| 2010-04-16 | 45.6 |
| 2010-04-19 | 48.8 |
| 2010-04-20 | 49.7 |
| 2010-04-21 | 49.3 |
| 2010-04-22 | 48.7 |
| 2010-04-23 | 48.6 |
| 2010-04-26 | 46.1 |
| 2010-04-27 | 43.4 |
| 2010-04-28 | 44.5 |
| 2010-04-29 | 45.6 |
| 2010-04-30 | 43.7 |
| 2010-05-03 | 44.1 |
| 2010-05-04 | 42.6 |
| 2010-05-05 | 41.8 |
| 2010-05-06 | 40.4 |
| 2010-05-07 | 40 |
| 2010-05-10 | 42.2 |
| 2010-05-11 | 41.7 |
| 2010-05-12 | 41.8 |
| 2010-05-13 | 40.9 |
| 2010-05-14 | 39.8 |
| 2010-05-17 | 38.6 |
| 2010-05-18 | 37.3 |
| 2010-05-19 | 38.1 |
| 2010-05-20 | 36.3 |
| 2010-05-21 | 37.5 |
| 2010-05-24 | 37.8 |
| 2010-05-25 | 37.8 |
| 2010-05-26 | 38.6 |
| 2010-05-27 | 40.2 |
| 2010-05-28 | 39.6 |
| 2010-05-31 | 39.6 |
| 2010-06-01 | 38.5 |
| 2010-06-02 | 39.2 |
| 2010-06-03 | 39.6 |
| 2010-06-04 | 37.9 |
| 2010-06-07 | 36.4 |
| 2010-06-08 | 37.2 |
| 2010-06-09 | 38.7 |
| 2010-06-10 | 39 |
| 2010-06-11 | 38.8 |
| 2010-06-14 | 38.8 |
| 2010-06-15 | 39.9 |
| 2010-06-16 | 39.9 |
| 2010-06-17 | 39.6 |
| 2010-06-18 | 40.1 |
| 2010-06-21 | 40.2 |
| 2010-06-22 | 39.4 |
| 2010-06-23 | 38.9 |
| 2010-06-24 | 37.8 |
| 2010-06-25 | 39.4 |
| 2010-06-28 | 40 |
| 2010-06-29 | 37.3 |
| 2010-06-30 | 37.6 |
| 2010-07-01 | 37.8 |
| 2010-07-02 | 37.9 |
| 2010-07-05 | 37.9 |
| 2010-07-06 | 37.9 |
| 2010-07-07 | 39 |
| 2010-07-08 | 39.7 |
| 2010-07-09 | 40.4 |
| 2010-07-12 | 41.1 |
| 2010-07-13 | 43 |
| 2010-07-14 | 42.1 |
| 2010-07-15 | 41.6 |
| 2010-07-16 | 39 |
| 2010-07-19 | 39.8 |
| 2010-07-20 | 39.9 |
| 2010-07-21 | 39.4 |
| 2010-07-22 | 40.9 |
| 2010-07-23 | 40.2 |
| 2010-07-26 | 41.5 |
| 2010-07-27 | 41.6 |
| 2010-07-28 | 40.9 |
| 2010-07-29 | 41.2 |
| 2010-07-30 | 41 |
| 2010-08-02 | 41.9 |
| 2010-08-03 | 41.3 |
| 2010-08-04 | 41.4 |
| 2010-08-05 | 41 |
| 2010-08-06 | 40.6 |
| 2010-08-09 | 40.8 |
| 2010-08-10 | 40 |
| 2010-08-11 | 38.5 |
| 2010-08-12 | 38.7 |
| 2010-08-13 | 38.8 |
| 2010-08-16 | 38.7 |
| 2010-08-17 | 38.5 |
| 2010-08-18 | 38.6 |
| 2010-08-19 | 37.9 |
| 2010-08-20 | 37.5 |
| 2010-08-23 | 37.5 |
| 2010-08-24 | 37.1 |
| 2010-08-25 | 36.8 |
| 2010-08-26 | 36.6 |
| 2010-08-27 | 37.6 |
| 2010-08-30 | 36.7 |
| 2010-08-31 | 37.09 |
| 2010-09-01 | 38.48 |
| 2010-09-02 | 38.8 |
| 2010-09-03 | 39.1 |
| 2010-09-06 | 39.1 |
| 2010-09-07 | 38.3 |
| 2010-09-08 | 38.4 |
| 2010-09-09 | 39.1 |
| 2010-09-10 | 39.1 |
| 2010-09-13 | 39.9 |
| 2010-09-14 | 39.4 |
| 2010-09-15 | 39.2 |
| 2010-09-16 | 39.7 |
| 2010-09-17 | 39.5 |
| 2010-09-20 | 39.9 |
| 2010-09-21 | 39.4 |
| 2010-09-22 | 38.8 |
| 2010-09-23 | 38 |
| 2010-09-24 | 39.04 |
| 2010-09-27 | 38.7 |
| 2010-09-28 | 38.83 |
| 2010-09-29 | 39.2 |
| 2010-09-30 | 39.1 |
| 2010-10-01 | 40.9 |
| 2010-10-04 | 40.3 |
| 2010-10-05 | 41.3 |
| 2010-10-06 | 41 |
| 2010-10-07 | 41.8 |
| 2010-10-08 | 41.9 |
| 2010-10-11 | 41.8 |
| 2010-10-12 | 42.4 |
| 2010-10-13 | 42.5 |
| 2010-10-14 | 40.6 |
| 2010-10-15 | 39.5 |
| 2010-10-18 | 41.7 |
| 2010-10-19 | 40.6 |
| 2010-10-20 | 41.1 |
| 2010-10-21 | 40.7 |
| 2010-10-22 | 41.1 |
| 2010-10-25 | 42.1 |
| 2010-10-26 | 41.8 |
| 2010-10-27 | 41.7 |
| 2010-10-28 | 41.7 |
| 2010-10-29 | 41.7 |
| 2010-11-01 | 41.5 |
| 2010-11-02 | 41.7 |
| 2010-11-03 | 41.9 |
| 2010-11-04 | 43.3 |
| 2010-11-05 | 44.9 |
| 2010-11-08 | 44.38 |
| 2010-11-09 | 43 |
| 2010-11-10 | 44.2 |
| 2010-11-11 | 43.6 |
| 2010-11-12 | 42.9 |
| 2010-11-15 | 43.2 |
| 2010-11-16 | 42.2 |
| 2010-11-17 | 41.9 |
| 2010-11-18 | 43 |
| 2010-11-19 | 42.68 |
| 2010-11-22 | 41.8 |
| 2010-11-23 | 41 |
| 2010-11-24 | 41.68 |
| 2010-11-25 | 41.68 |
| 2010-11-26 | 41.1 |
| 2010-11-29 | 41.5 |
| 2010-11-30 | 42 |
| 2010-12-01 | 43 |
| 2010-12-02 | 44.2 |
| 2010-12-03 | 44.5 |
| 2010-12-06 | 44.5 |
| 2010-12-07 | 46.2 |
| 2010-12-08 | 46.4 |
| 2010-12-09 | 46.88 |
| 2010-12-10 | 47.7 |
| 2010-12-13 | 48.1 |
| 2010-12-14 | 46.9 |
| 2010-12-15 | 45.9 |
| 2010-12-16 | 45.87 |
| 2010-12-17 | 47 |
| 2010-12-20 | 47.1 |
| 2010-12-21 | 47.4 |
| 2010-12-22 | 47.3 |
| 2010-12-23 | 46.8 |
| 2010-12-24 | 46.8 |
| 2010-12-27 | 47.7 |
| 2010-12-28 | 47.8 |
| 2010-12-29 | 47.7 |
| 2010-12-30 | 47.6 |
| 2010-12-31 | 47.3 |
| 2011-01-03 | 49 |
| 2011-01-04 | 49 |
| 2011-01-05 | 49.7 |
| 2011-01-06 | 49.5 |
| 2011-01-07 | 49.4 |
| 2011-01-10 | 49.1 |
| 2011-01-11 | 49.4 |
| 2011-01-12 | 50.8 |
| 2011-01-13 | 50.4 |
| 2011-01-14 | 51.3 |
| 2011-01-17 | 51.3 |
| 2011-01-18 | 48 |
| 2011-01-19 | 47.6 |
| 2011-01-20 | 48 |
| 2011-01-21 | 48.9 |
| 2011-01-24 | 48.6 |
| 2011-01-25 | 48.2 |
| 2011-01-26 | 48.1 |
| 2011-01-27 | 48.3 |
| 2011-01-28 | 47.2 |
| 2011-01-31 | 48.2 |
| 2011-02-01 | 49 |
| 2011-02-02 | 48.5 |
| 2011-02-03 | 48.1 |
| 2011-02-04 | 48.2 |
| 2011-02-07 | 49 |
| 2011-02-08 | 48.9 |
| 2011-02-09 | 48.4 |
| 2011-02-10 | 47.8 |
| 2011-02-11 | 48.8 |
| 2011-02-14 | 49.1 |
| 2011-02-15 | 49.1 |
| 2011-02-16 | 49 |
| 2011-02-17 | 49.4 |
| 2011-02-18 | 49.1 |
| 2011-02-21 | 49.1 |
| 2011-02-22 | 46.9 |
| 2011-02-23 | 47 |
| 2011-02-24 | 46.9 |
| 2011-02-25 | 47 |
| 2011-02-28 | 46.8 |
| 2011-03-01 | 45.7 |
| 2011-03-02 | 46 |
| 2011-03-03 | 46.8 |
| 2011-03-04 | 45.4 |
| 2011-03-07 | 45.2 |
| 2011-03-08 | 46.4 |
| 2011-03-09 | 46.5 |
| 2011-03-10 | 45.4 |
| 2011-03-11 | 45.7 |
| 2011-03-14 | 45.4 |
| 2011-03-15 | 44.4 |
| 2011-03-16 | 43.9 |
| 2011-03-17 | 44.5 |
| 2011-03-18 | 45 |
| 2011-03-21 | 44.33 |
| 2011-03-22 | 44.2 |
| 2011-03-23 | 44 |
| 2011-03-24 | 44.3 |
| 2011-03-25 | 44.6 |
| 2011-03-28 | 44.3 |
| 2011-03-29 | 44.5 |
| 2011-03-30 | 44.5 |
| 2011-03-31 | 44.2 |
| 2011-04-01 | 44.5 |
| 2011-04-04 | 44.3 |
| 2011-04-05 | 44.7 |
| 2011-04-06 | 45.9 |
| 2011-04-07 | 45.8 |
| 2011-04-08 | 45.6 |
| 2011-04-11 | 45.3 |
| 2011-04-12 | 45.5 |
| 2011-04-13 | 45 |
| 2011-04-14 | 44.3 |
| 2011-04-15 | 44.2 |
| 2011-04-18 | 44.2 |
| 2011-04-19 | 45.3 |
| 2011-04-20 | 45.7 |
| 2011-04-21 | 45.5 |
| 2011-04-22 | 45.5 |
| 2011-04-25 | 45.2 |
| 2011-04-26 | 45.1 |
| 2011-04-27 | 45.1 |
| 2011-04-28 | 45.9 |
| 2011-04-29 | 45.9 |
| 2011-05-02 | 44.9 |
| 2011-05-03 | 45.2 |
| 2011-05-04 | 45.15 |
| 2011-05-05 | 44.8 |
| 2011-05-06 | 45.2 |
| 2011-05-09 | 44.16 |
| 2011-05-10 | 44.2 |
| 2011-05-11 | 42.92 |
| 2011-05-12 | 42.42 |
| 2011-05-13 | 41.53 |
| 2011-05-16 | 41.19 |
| 2011-05-17 | 41.54 |
| 2011-05-18 | 41.24 |
| 2011-05-19 | 41.38 |
| 2011-05-20 | 41.02 |
| 2011-05-23 | 40.16 |
| 2011-05-24 | 40.51 |
| 2011-05-25 | 40.33 |
| 2011-05-26 | 40.22 |
| 2011-05-27 | 40.97 |
| 2011-05-30 | 40.97 |
| 2011-05-31 | 41.15 |
| 2011-06-01 | 39.65 |
| 2011-06-02 | 40.01 |
| 2011-06-03 | 39.85 |
| 2011-06-06 | 38.07 |
| 2011-06-07 | 37.58 |
| 2011-06-08 | 36.81 |
| 2011-06-09 | 37.77 |
| 2011-06-10 | 37.92 |
| 2011-06-13 | 39.17 |
| 2011-06-14 | 38.78 |
| 2011-06-15 | 38 |
| 2011-06-16 | 37.63 |
| 2011-06-17 | 38.3 |
| 2011-06-20 | 38.16 |
| 2011-06-21 | 39.31 |
| 2011-06-22 | 39.51 |
| 2011-06-23 | 39.41 |
| 2011-06-24 | 39.59 |
| 2011-06-27 | 39.99 |
| 2011-06-28 | 40.15 |
| 2011-06-29 | 41.5 |
| 2011-06-30 | 41.64 |
| 2011-07-01 | 42.88 |
| 2011-07-04 | 42.88 |
| 2011-07-05 | 42.57 |
| 2011-07-06 | 42.01 |
| 2011-07-07 | 42.63 |
| 2011-07-08 | 42.03 |
| 2011-07-11 | 39.79 |
| 2011-07-12 | 39.07 |
| 2011-07-13 | 39.47 |
| 2011-07-14 | 39.02 |
| 2011-07-15 | 38.38 |
| 2011-07-18 | 37.74 |
| 2011-07-19 | 38.02 |
| 2011-07-20 | 38.62 |
| 2011-07-21 | 40.32 |
| 2011-07-22 | 40.26 |
| 2011-07-25 | 39.91 |
| 2011-07-26 | 39.72 |
| 2011-07-27 | 38.27 |
| 2011-07-28 | 38.18 |
| 2011-07-29 | 38.34 |
| 2011-08-01 | 38.48 |
| 2011-08-02 | 37.04 |
| 2011-08-03 | 37.26 |
| 2011-08-04 | 34.81 |
| 2011-08-05 | 33.44 |
| 2011-08-08 | 27.95 |
| 2011-08-09 | 31.82 |
| 2011-08-10 | 28.49 |
| 2011-08-11 | 30.29 |
| 2011-08-12 | 29.85 |
| 2011-08-15 | 31.27 |
| 2011-08-16 | 29.94 |
| 2011-08-17 | 29.85 |
| 2011-08-18 | 27.98 |
| 2011-08-19 | 26.77 |
| 2011-08-22 | 26.06 |
| 2011-08-23 | 27.32 |
| 2011-08-24 | 28.45 |
| 2011-08-25 | 29.83 |
| 2011-08-26 | 29.84 |
| 2011-08-29 | 31.29 |
| 2011-08-30 | 30.94 |
| 2011-08-31 | 31.05 |
| 2011-09-01 | 30 |
| 2011-09-02 | 28.4 |
| 2011-09-05 | 28.4 |
| 2011-09-06 | 27.7 |
| 2011-09-07 | 28.98 |
| 2011-09-08 | 27.98 |
| 2011-09-09 | 26.74 |
| 2011-09-12 | 26.96 |
| 2011-09-13 | 27.05 |
| 2011-09-14 | 27.39 |
| 2011-09-15 | 28.59 |
| 2011-09-16 | 28.99 |
| 2011-09-19 | 27.71 |
| 2011-09-20 | 26.93 |
| 2011-09-21 | 25.52 |
| 2011-09-22 | 23.96 |
| 2011-09-23 | 24.98 |
| 2011-09-26 | 26.72 |
| 2011-09-27 | 26.99 |
| 2011-09-28 | 25.92 |
| 2011-09-29 | 26.9 |
| 2011-09-30 | 25.62 |
| 2011-10-03 | 23.11 |
| 2011-10-04 | 24.39 |
| 2011-10-05 | 24.71 |
| 2011-10-06 | 26.02 |
| 2011-10-07 | 24.63 |
| 2011-10-10 | 26.49 |
| 2011-10-11 | 27.84 |
| 2011-10-12 | 29.2 |
| 2011-10-13 | 27.64 |
| 2011-10-14 | 28.4 |
| 2011-10-17 | 27.93 |
| 2011-10-18 | 29.88 |
| 2011-10-19 | 29.39 |
| 2011-10-20 | 30.08 |
| 2011-10-21 | 30.3 |
| 2011-10-24 | 31.6 |
| 2011-10-25 | 30.9 |
| 2011-10-26 | 31.15 |
| 2011-10-27 | 33.77 |
| 2011-10-28 | 34.16 |
| 2011-10-31 | 31.59 |
| 2011-11-01 | 29.17 |
| 2011-11-02 | 29.83 |
| 2011-11-03 | 30.78 |
| 2011-11-04 | 30.34 |
| 2011-11-07 | 30.55 |
| 2011-11-08 | 31.42 |
| 2011-11-09 | 28.85 |
| 2011-11-10 | 28.63 |
| 2011-11-11 | 29.33 |
| 2011-11-14 | 28.38 |
| 2011-11-15 | 28.02 |
| 2011-11-16 | 26.86 |
| 2011-11-17 | 26 |
| 2011-11-18 | 26.28 |
| 2011-11-21 | 25 |
| 2011-11-22 | 24.46 |
| 2011-11-23 | 23.51 |
| 2011-11-24 | 23.51 |
| 2011-11-25 | 23.63 |
| 2011-11-28 | 25.05 |
| 2011-11-29 | 25.24 |
| 2011-11-30 | 27.48 |
| 2011-12-01 | 26.99 |
| 2011-12-02 | 28.17 |
| 2011-12-05 | 29.83 |
| 2011-12-06 | 29.75 |
| 2011-12-07 | 29.83 |
| 2011-12-08 | 27.75 |
| 2011-12-09 | 28.77 |
| 2011-12-12 | 27.22 |
| 2011-12-13 | 26.9 |
| 2011-12-14 | 26.05 |
| 2011-12-15 | 25.92 |
| 2011-12-16 | 26.03 |
| 2011-12-19 | 24.82 |
| 2011-12-20 | 25.95 |
| 2011-12-21 | 26.1 |
| 2011-12-22 | 27.65 |
| 2011-12-23 | 27.46 |
| 2011-12-26 | 27.46 |
| 2011-12-27 | 26.9 |
| 2011-12-28 | 26.13 |
| 2011-12-29 | 26.76 |
| 2011-12-30 | 26.31 |
| 2012-01-02 | 26.31 |
| 2012-01-03 | 28.33 |
| 2012-01-04 | 28.17 |
| 2012-01-05 | 28.51 |
| 2012-01-06 | 28.55 |
| 2012-01-09 | 29.08 |
| 2012-01-10 | 30 |
| 2012-01-11 | 31.27 |
| 2012-01-12 | 31.6 |
| 2012-01-13 | 30.74 |
| 2012-01-16 | 30.74 |
| 2012-01-17 | 28.22 |
| 2012-01-18 | 29.03 |
| 2012-01-19 | 29.33 |
| 2012-01-20 | 29.64 |
| 2012-01-23 | 29.85 |
| 2012-01-24 | 29.9 |
| 2012-01-25 | 29.96 |
| 2012-01-26 | 30.38 |
| 2012-01-27 | 30.87 |
| 2012-01-30 | 30.23 |
| 2012-01-31 | 30.72 |
| 2012-02-01 | 31.6 |
| 2012-02-02 | 31.99 |
| 2012-02-03 | 33.54 |
| 2012-02-06 | 33.3 |
| 2012-02-07 | 33.07 |
| 2012-02-08 | 34.23 |
| 2012-02-09 | 33.66 |
| 2012-02-10 | 32.93 |
| 2012-02-13 | 32.88 |
| 2012-02-14 | 32.08 |
| 2012-02-15 | 31.72 |
| 2012-02-16 | 32.71 |
| 2012-02-17 | 32.92 |
| 2012-02-20 | 32.92 |
| 2012-02-21 | 33.36 |
| 2012-02-22 | 32.36 |
| 2012-02-23 | 32.71 |
| 2012-02-24 | 32.35 |
| 2012-02-27 | 32.93 |
| 2012-02-28 | 33.48 |
| 2012-02-29 | 33.32 |
| 2012-03-01 | 34.13 |
| 2012-03-02 | 34.1 |
| 2012-03-05 | 33.68 |
| 2012-03-06 | 32.12 |
| 2012-03-07 | 33.24 |
| 2012-03-08 | 34 |
| 2012-03-09 | 34.2 |
| 2012-03-12 | 34.29 |
| 2012-03-13 | 36.45 |
| 2012-03-14 | 35.21 |
| 2012-03-15 | 36.27 |
| 2012-03-16 | 36.69 |
| 2012-03-19 | 37.17 |
| 2012-03-20 | 38.08 |
| 2012-03-21 | 37.8 |
| 2012-03-22 | 36.9 |
| 2012-03-23 | 37.14 |
| 2012-03-26 | 37.43 |
| 2012-03-27 | 36.78 |
| 2012-03-28 | 37.06 |
| 2012-03-29 | 36.51 |
| 2012-03-30 | 36.55 |
| 2012-04-02 | 36.87 |
| 2012-04-03 | 36.37 |
| 2012-04-04 | 35.04 |
| 2012-04-05 | 34.79 |
| 2012-04-06 | 34.79 |
| 2012-04-09 | 33.97 |
| 2012-04-10 | 32.86 |
| 2012-04-11 | 33.59 |
| 2012-04-12 | 34.63 |
| 2012-04-13 | 33.41 |
| 2012-04-16 | 34 |
| 2012-04-17 | 35.08 |
| 2012-04-18 | 35.08 |
| 2012-04-19 | 34.85 |
| 2012-04-20 | 33.89 |
| 2012-04-23 | 33.25 |
| 2012-04-24 | 33.42 |
| 2012-04-25 | 33.68 |
| 2012-04-26 | 33.88 |
| 2012-04-27 | 33.5 |
| 2012-04-30 | 33.05 |
| 2012-05-01 | 33.6 |
| 2012-05-02 | 32.7 |
| 2012-05-03 | 32.48 |
| 2012-05-04 | 31.6 |
| 2012-05-07 | 31.67 |
| 2012-05-08 | 31.32 |
| 2012-05-09 | 30.45 |
| 2012-05-10 | 30.65 |
| 2012-05-11 | 29.35 |
| 2012-05-14 | 28.14 |
| 2012-05-15 | 27.79 |
| 2012-05-16 | 26.92 |
| 2012-05-17 | 26.41 |
| 2012-05-18 | 26.01 |
| 2012-05-21 | 26.25 |
| 2012-05-22 | 26.92 |
| 2012-05-23 | 26.92 |
| 2012-05-24 | 26.66 |
| 2012-05-25 | 26.47 |
| 2012-05-28 | 26.47 |
| 2012-05-29 | 27.02 |
| 2012-05-30 | 26 |
| 2012-05-31 | 26.51 |
| 2012-06-01 | 25.39 |
| 2012-06-04 | 24.82 |
| 2012-06-05 | 25.75 |
| 2012-06-06 | 27.14 |
| 2012-06-07 | 26.91 |
| 2012-06-08 | 27.77 |
| 2012-06-11 | 26.48 |
| 2012-06-12 | 27.62 |
| 2012-06-13 | 27.67 |
| 2012-06-14 | 27.91 |
| 2012-06-15 | 28.31 |
| 2012-06-18 | 27.55 |
| 2012-06-19 | 28.5 |
| 2012-06-20 | 28.86 |
| 2012-06-21 | 27.83 |
| 2012-06-22 | 27.99 |
| 2012-06-25 | 26.75 |
| 2012-06-26 | 26.73 |
| 2012-06-27 | 27.1 |
| 2012-06-28 | 26.39 |
| 2012-06-29 | 27.41 |
| 2012-07-02 | 27.46 |
| 2012-07-03 | 27.65 |
| 2012-07-04 | 27.65 |
| 2012-07-05 | 26.84 |
| 2012-07-06 | 26.36 |
| 2012-07-09 | 26.11 |
| 2012-07-10 | 25.88 |
| 2012-07-11 | 25.87 |
| 2012-07-12 | 25.28 |
| 2012-07-13 | 26.65 |
| 2012-07-16 | 26.81 |
| 2012-07-17 | 27.38 |
| 2012-07-18 | 27.1 |
| 2012-07-19 | 26.59 |
| 2012-07-20 | 25.87 |
| 2012-07-23 | 25.34 |
| 2012-07-24 | 25.24 |
| 2012-07-25 | 25.79 |
| 2012-07-26 | 26.28 |
| 2012-07-27 | 27.3 |
| 2012-07-30 | 27.14 |
| 2012-07-31 | 27.13 |
| 2012-08-01 | 26.78 |
| 2012-08-02 | 26.18 |
| 2012-08-03 | 27.4 |
| 2012-08-06 | 28.56 |
| 2012-08-07 | 28.89 |
| 2012-08-08 | 28.86 |
| 2012-08-09 | 28.86 |
| 2012-08-10 | 28.9 |
| 2012-08-13 | 28.78 |
| 2012-08-14 | 28.77 |
| 2012-08-15 | 28.74 |
| 2012-08-16 | 28.82 |
| 2012-08-17 | 29.03 |
| 2012-08-20 | 29.98 |
| 2012-08-21 | 30.73 |
| 2012-08-22 | 30.49 |
| 2012-08-23 | 29.59 |
| 2012-08-24 | 29.83 |
| 2012-08-27 | 29.69 |
| 2012-08-28 | 29.34 |
| 2012-08-29 | 29.91 |
| 2012-08-30 | 29.65 |
| 2012-08-31 | 29.71 |
| 2012-09-03 | 29.71 |
| 2012-09-04 | 29.7 |
| 2012-09-05 | 29.77 |
| 2012-09-06 | 31.12 |
| 2012-09-07 | 32.07 |
| 2012-09-10 | 31.83 |
| 2012-09-11 | 32.66 |
| 2012-09-12 | 33.05 |
| 2012-09-13 | 34.45 |
| 2012-09-14 | 34.79 |
| 2012-09-17 | 34.06 |
| 2012-09-18 | 33.94 |
| 2012-09-19 | 34.18 |
| 2012-09-20 | 33.81 |
| 2012-09-21 | 33.67 |
| 2012-09-24 | 33.49 |
| 2012-09-25 | 32.86 |
| 2012-09-26 | 32.51 |
| 2012-09-27 | 32.97 |
| 2012-09-28 | 32.72 |
| 2012-10-01 | 32.75 |
| 2012-10-02 | 33.26 |
| 2012-10-03 | 34.06 |
| 2012-10-04 | 34.96 |
| 2012-10-05 | 34.77 |
| 2012-10-08 | 34.78 |
| 2012-10-09 | 34.6 |
| 2012-10-10 | 35.14 |
| 2012-10-11 | 35.52 |
| 2012-10-12 | 34.75 |
| 2012-10-15 | 36.66 |
| 2012-10-16 | 37.25 |
| 2012-10-17 | 38.43 |
| 2012-10-18 | 38.42 |
| 2012-10-19 | 37.16 |
| 2012-10-22 | 37.72 |
| 2012-10-23 | 36.89 |
| 2012-10-24 | 37.3 |
| 2012-10-25 | 37.41 |
| 2012-10-26 | 36.6 |
| 2012-10-29 | 36.6 |
| 2012-10-30 | 36.6 |
| 2012-10-31 | 37.39 |
| 2012-11-01 | 37.95 |
| 2012-11-02 | 37.6 |
| 2012-11-05 | 37.32 |
| 2012-11-06 | 38.47 |
| 2012-11-07 | 36.05 |
| 2012-11-08 | 36 |
| 2012-11-09 | 35.93 |
| 2012-11-12 | 36.42 |
| 2012-11-13 | 36.16 |
| 2012-11-14 | 35.02 |
| 2012-11-15 | 35.21 |
| 2012-11-16 | 34.98 |
| 2012-11-19 | 36.1 |
| 2012-11-20 | 36 |
| 2012-11-21 | 35.77 |
| 2012-11-22 | 35.77 |
| 2012-11-23 | 36.03 |
| 2012-11-26 | 35.57 |
| 2012-11-27 | 35.04 |
| 2012-11-28 | 35.07 |
| 2012-11-29 | 35.21 |
| 2012-11-30 | 34.57 |
| 2012-12-03 | 34.22 |
| 2012-12-04 | 34.29 |
| 2012-12-05 | 36.46 |
| 2012-12-06 | 37.02 |
| 2012-12-07 | 37.64 |
| 2012-12-10 | 37.19 |
| 2012-12-11 | 37 |
| 2012-12-12 | 37.53 |
| 2012-12-13 | 37.29 |
| 2012-12-14 | 37.6 |
| 2012-12-17 | 39.15 |
| 2012-12-18 | 39.46 |
| 2012-12-19 | 39.45 |
| 2012-12-20 | 40.17 |
| 2012-12-21 | 39.49 |
| 2012-12-24 | 39.38 |
| 2012-12-25 | 39.38 |
| 2012-12-26 | 39.55 |
| 2012-12-27 | 39.25 |
| 2012-12-28 | 39.01 |
| 2012-12-31 | 39.56 |
| 2013-01-01 | 39.56 |
| 2013-01-02 | 41.25 |
| 2013-01-03 | 41.39 |
| 2013-01-04 | 42.43 |
| 2013-01-07 | 42.47 |
| 2013-01-08 | 42.46 |
| 2013-01-09 | 42.04 |
| 2013-01-10 | 42.83 |
| 2013-01-11 | 42.34 |
| 2013-01-14 | 42.22 |
| 2013-01-15 | 42.57 |
| 2013-01-16 | 42.48 |
| 2013-01-17 | 41.24 |
| 2013-01-18 | 41.66 |
| 2013-01-21 | 41.66 |
| 2013-01-22 | 41.78 |
| 2013-01-23 | 42.02 |
| 2013-01-24 | 42.8 |
| 2013-01-25 | 42.91 |
| 2013-01-28 | 42.34 |
| 2013-01-29 | 42.16 |
| 2013-01-30 | 41.95 |
| 2013-01-31 | 42.16 |
| 2013-02-01 | 43.02 |
| 2013-02-04 | 42.21 |
| 2013-02-05 | 42.92 |
| 2013-02-06 | 43.05 |
| 2013-02-07 | 42.87 |
| 2013-02-08 | 42.68 |
| 2013-02-11 | 43.15 |
| 2013-02-12 | 44.35 |
| 2013-02-13 | 44 |
| 2013-02-14 | 44.32 |
| 2013-02-15 | 43.84 |
| 2013-02-18 | 43.84 |
| 2013-02-19 | 44.5 |
| 2013-02-20 | 43.22 |
| 2013-02-21 | 42.35 |
| 2013-02-22 | 42.79 |
| 2013-02-25 | 41.15 |
| 2013-02-26 | 41.29 |
| 2013-02-27 | 42.16 |
| 2013-02-28 | 41.97 |
| 2013-03-01 | 42.11 |
| 2013-03-04 | 42.94 |
| 2013-03-05 | 43.6 |
| 2013-03-06 | 44.58 |
| 2013-03-07 | 45 |
| 2013-03-08 | 46.68 |
| 2013-03-11 | 47.6 |
| 2013-03-12 | 46.95 |
| 2013-03-13 | 46.97 |
| 2013-03-14 | 47.46 |
| 2013-03-15 | 47.26 |
| 2013-03-18 | 46.24 |
| 2013-03-19 | 45.79 |
| 2013-03-20 | 46.09 |
| 2013-03-21 | 45.23 |
| 2013-03-22 | 45.23 |
| 2013-03-25 | 44.49 |
| 2013-03-26 | 44.83 |
| 2013-03-27 | 44.46 |
| 2013-03-28 | 44.24 |
| 2013-03-29 | 44.24 |
| 2013-04-01 | 43.79 |
| 2013-04-02 | 44.11 |
| 2013-04-03 | 42.5 |
| 2013-04-04 | 42.77 |
| 2013-04-05 | 43.01 |
| 2013-04-08 | 43.56 |
| 2013-04-09 | 43.89 |
| 2013-04-10 | 45.06 |
| 2013-04-11 | 44.87 |
| 2013-04-12 | 44.78 |
| 2013-04-15 | 44.87 |
| 2013-04-16 | 46.66 |
| 2013-04-17 | 45.74 |
| 2013-04-18 | 45.09 |
| 2013-04-19 | 45.03 |
| 2013-04-22 | 45.15 |
| 2013-04-23 | 46.46 |
| 2013-04-24 | 47.12 |
| 2013-04-25 | 47.11 |
| 2013-04-26 | 46.92 |
| 2013-04-29 | 46.82 |
| 2013-04-30 | 46.66 |
| 2013-05-01 | 45.87 |
| 2013-05-02 | 46.54 |
| 2013-05-03 | 46.97 |
| 2013-05-06 | 47.48 |
| 2013-05-07 | 48.11 |
| 2013-05-08 | 49.29 |
| 2013-05-09 | 48.6 |
| 2013-05-10 | 48.75 |
| 2013-05-13 | 48.92 |
| 2013-05-14 | 50.09 |
| 2013-05-15 | 51.34 |
| 2013-05-16 | 50.61 |
| 2013-05-17 | 51.45 |
| 2013-05-20 | 51.6 |
| 2013-05-21 | 51.66 |
| 2013-05-22 | 51 |
| 2013-05-23 | 50.53 |
| 2013-05-24 | 50.52 |
| 2013-05-27 | 50.52 |
| 2013-05-28 | 51.79 |
| 2013-05-29 | 52.28 |
| 2013-05-30 | 53.27 |
| 2013-05-31 | 51.99 |
| 2013-06-03 | 51.96 |
| 2013-06-04 | 51.23 |
| 2013-06-05 | 50.03 |
| 2013-06-06 | 50.83 |
| 2013-06-07 | 51.6 |
| 2013-06-10 | 51.93 |
| 2013-06-11 | 49.95 |
| 2013-06-12 | 49.44 |
| 2013-06-13 | 50.29 |
| 2013-06-14 | 49.22 |
| 2013-06-17 | 49.36 |
| 2013-06-18 | 50.01 |
| 2013-06-19 | 49.53 |
| 2013-06-20 | 47.9 |
| 2013-06-21 | 46.87 |
| 2013-06-24 | 45.44 |
| 2013-06-25 | 47 |
| 2013-06-26 | 47.61 |
| 2013-06-27 | 48.28 |
| 2013-06-28 | 47.97 |
| 2013-07-01 | 48.25 |
| 2013-07-02 | 48.15 |
| 2013-07-03 | 47.67 |
| 2013-07-04 | 47.67 |
| 2013-07-05 | 48.53 |
| 2013-07-08 | 49.52 |
| 2013-07-09 | 50.21 |
| 2013-07-10 | 49.63 |
| 2013-07-11 | 50.04 |
| 2013-07-12 | 50.81 |
| 2013-07-15 | 51.81 |
| 2013-07-16 | 51.83 |
| 2013-07-17 | 51.79 |
| 2013-07-18 | 52.69 |
| 2013-07-19 | 52.35 |
| 2013-07-22 | 53 |
| 2013-07-23 | 52.88 |
| 2013-07-24 | 52.19 |
| 2013-07-25 | 52.66 |
| 2013-07-26 | 52.21 |
| 2013-07-29 | 51.64 |
| 2013-07-30 | 51.78 |
| 2013-07-31 | 52.14 |
| 2013-08-01 | 52.86 |
| 2013-08-02 | 53 |
| 2013-08-05 | 52.87 |
| 2013-08-06 | 51.48 |
| 2013-08-07 | 51.5 |
| 2013-08-08 | 51.78 |
| 2013-08-09 | 51.32 |
| 2013-08-12 | 50.9 |
| 2013-08-13 | 51.77 |
| 2013-08-14 | 51.59 |
| 2013-08-15 | 50.86 |
| 2013-08-16 | 50.35 |
| 2013-08-19 | 49.33 |
| 2013-08-20 | 49.92 |
| 2013-08-21 | 49.16 |
| 2013-08-22 | 49.91 |
| 2013-08-23 | 49.83 |
| 2013-08-26 | 49.6 |
| 2013-08-27 | 48.24 |
| 2013-08-28 | 48.31 |
| 2013-08-29 | 48.47 |
| 2013-08-30 | 48.33 |
| 2013-09-02 | 48.33 |
| 2013-09-03 | 49.37 |
| 2013-09-04 | 49.6 |
| 2013-09-05 | 49.86 |
| 2013-09-06 | 49.22 |
| 2013-09-09 | 50.09 |
| 2013-09-10 | 51.09 |
| 2013-09-11 | 50.73 |
| 2013-09-12 | 50.26 |
| 2013-09-13 | 50.49 |
| 2013-09-16 | 51 |
| 2013-09-17 | 51.2 |
| 2013-09-18 | 52.21 |
| 2013-09-19 | 51.95 |
| 2013-09-20 | 51.21 |
| 2013-09-23 | 49.57 |
| 2013-09-24 | 48.96 |
| 2013-09-25 | 49.26 |
| 2013-09-26 | 48.93 |
| 2013-09-27 | 48.89 |
| 2013-09-30 | 48.51 |
| 2013-10-01 | 48.6 |
| 2013-10-02 | 48.71 |
| 2013-10-03 | 48.4 |
| 2013-10-04 | 49.14 |
| 2013-10-07 | 48.18 |
| 2013-10-08 | 47.67 |
| 2013-10-09 | 47.95 |
| 2013-10-10 | 49.27 |
| 2013-10-11 | 49.22 |
| 2013-10-14 | 49.6 |
| 2013-10-15 | 48.86 |
| 2013-10-16 | 50.84 |
| 2013-10-17 | 51.12 |
| 2013-10-18 | 51.15 |
| 2013-10-21 | 51.03 |
| 2013-10-22 | 50.76 |
| 2013-10-23 | 50.19 |
| 2013-10-24 | 50.15 |
| 2013-10-25 | 50.06 |
| 2013-10-28 | 50.15 |
| 2013-10-29 | 50.22 |
| 2013-10-30 | 49.89 |
| 2013-10-31 | 48.78 |
| 2013-11-01 | 48.74 |
| 2013-11-04 | 48.63 |
| 2013-11-05 | 48.38 |
| 2013-11-06 | 48.62 |
| 2013-11-07 | 48.35 |
| 2013-11-08 | 49.94 |
| 2013-11-11 | 50.17 |
| 2013-11-12 | 49.52 |
| 2013-11-13 | 49.99 |
| 2013-11-14 | 50.21 |
| 2013-11-15 | 50.4 |
| 2013-11-18 | 50.79 |
| 2013-11-19 | 51.17 |
| 2013-11-20 | 50.77 |
| 2013-11-21 | 51.73 |
| 2013-11-22 | 52.41 |
| 2013-11-25 | 53.29 |
| 2013-11-26 | 53.01 |
| 2013-11-27 | 53.05 |
| 2013-11-28 | 53.05 |
| 2013-11-29 | 52.92 |
| 2013-12-02 | 52.62 |
| 2013-12-03 | 52.13 |
| 2013-12-04 | 52.04 |
| 2013-12-05 | 51.06 |
| 2013-12-06 | 51.49 |
| 2013-12-09 | 52.11 |
| 2013-12-10 | 51.74 |
| 2013-12-11 | 50.71 |
| 2013-12-12 | 50.91 |
| 2013-12-13 | 50.97 |
| 2013-12-16 | 50.9 |
| 2013-12-17 | 50.69 |
| 2013-12-18 | 51.96 |
| 2013-12-19 | 51.88 |
| 2013-12-20 | 52.21 |
| 2013-12-23 | 52.41 |
| 2013-12-24 | 52.43 |
| 2013-12-25 | 52.43 |
| 2013-12-26 | 52.35 |
| 2013-12-27 | 52.26 |
| 2013-12-30 | 51.92 |
| 2013-12-31 | 52.11 |
| 2014-01-01 | 52.11 |
| 2014-01-02 | 52.27 |
| 2014-01-03 | 53.4 |
| 2014-01-06 | 53.81 |
| 2014-01-07 | 54.18 |
| 2014-01-08 | 54.81 |
| 2014-01-09 | 55.2 |
| 2014-01-10 | 54.72 |
| 2014-01-13 | 53.72 |
| 2014-01-14 | 53.95 |
| 2014-01-15 | 54.99 |
| 2014-01-16 | 52.6 |
| 2014-01-17 | 52.27 |
| 2014-01-20 | 52.27 |
| 2014-01-21 | 51.85 |
| 2014-01-22 | 51.9 |
| 2014-01-23 | 50.72 |
| 2014-01-24 | 49.33 |
| 2014-01-27 | 48.81 |
| 2014-01-28 | 49.6 |
| 2014-01-29 | 48.08 |
| 2014-01-30 | 48.3 |
| 2014-01-31 | 47.43 |
| 2014-02-03 | 46.34 |
| 2014-02-04 | 46.78 |
| 2014-02-05 | 47.06 |
| 2014-02-06 | 48.25 |
| 2014-02-07 | 49.34 |
| 2014-02-10 | 49.32 |
| 2014-02-11 | 49.66 |
| 2014-02-12 | 49.96 |
| 2014-02-13 | 49.86 |
| 2014-02-14 | 49.52 |
| 2014-02-17 | 49.52 |
| 2014-02-18 | 49.38 |
| 2014-02-19 | 48.19 |
| 2014-02-20 | 48.13 |
| 2014-02-21 | 48.26 |
| 2014-02-24 | 48.98 |
| 2014-02-25 | 48.4 |
| 2014-02-26 | 48.32 |
| 2014-02-27 | 48.69 |
| 2014-02-28 | 48.63 |
| 2014-03-03 | 47.61 |
| 2014-03-04 | 48.83 |
| 2014-03-05 | 49.42 |
| 2014-03-06 | 49.71 |
| 2014-03-07 | 49.62 |
| 2014-03-10 | 49.57 |
| 2014-03-11 | 48.43 |
| 2014-03-12 | 47.98 |
| 2014-03-13 | 47.33 |
| 2014-03-14 | 46.88 |
| 2014-03-17 | 47.73 |
| 2014-03-18 | 48.14 |
| 2014-03-19 | 48.94 |
| 2014-03-20 | 50.22 |
| 2014-03-21 | 50.08 |
| 2014-03-24 | 50.05 |
| 2014-03-25 | 50.3 |
| 2014-03-26 | 50.16 |
| 2014-03-27 | 47.45 |
| 2014-03-28 | 47.25 |
| 2014-03-31 | 47.6 |
| 2014-04-01 | 47.8 |
| 2014-04-02 | 48.24 |
| 2014-04-03 | 47.68 |
| 2014-04-04 | 47.11 |
| 2014-04-07 | 46.55 |
| 2014-04-08 | 46.6 |
| 2014-04-09 | 47.16 |
| 2014-04-10 | 46.23 |
| 2014-04-11 | 45.68 |
| 2014-04-14 | 47.67 |
| 2014-04-15 | 48.31 |
| 2014-04-16 | 48.18 |
| 2014-04-17 | 48.22 |
| 2014-04-18 | 48.22 |
| 2014-04-21 | 47.84 |
| 2014-04-22 | 48.02 |
| 2014-04-23 | 48.4 |
| 2014-04-24 | 48.33 |
| 2014-04-25 | 47.75 |
| 2014-04-28 | 47.3 |
| 2014-04-29 | 48.16 |
| 2014-04-30 | 47.91 |
| 2014-05-01 | 47.76 |
| 2014-05-02 | 47.73 |
| 2014-05-05 | 47.18 |
| 2014-05-06 | 46.36 |
| 2014-05-07 | 46.7 |
| 2014-05-08 | 47.14 |
| 2014-05-09 | 46.99 |
| 2014-05-12 | 47.27 |
| 2014-05-13 | 47.42 |
| 2014-05-14 | 47.12 |
| 2014-05-15 | 46.52 |
| 2014-05-16 | 46.44 |
| 2014-05-19 | 46.77 |
| 2014-05-20 | 46.55 |
| 2014-05-21 | 46.85 |
| 2014-05-22 | 47.14 |
| 2014-05-23 | 47.29 |
| 2014-05-26 | 47.29 |
| 2014-05-27 | 47.57 |
| 2014-05-28 | 47.32 |
| 2014-05-29 | 47.28 |
| 2014-05-30 | 47.57 |
| 2014-06-02 | 47.76 |
| 2014-06-03 | 48.19 |
| 2014-06-04 | 47.88 |
| 2014-06-05 | 48.63 |
| 2014-06-06 | 48.93 |
| 2014-06-09 | 49.58 |
| 2014-06-10 | 49.33 |
| 2014-06-11 | 48.81 |
| 2014-06-12 | 48.27 |
| 2014-06-13 | 47.59 |
| 2014-06-16 | 47.64 |
| 2014-06-17 | 47.79 |
| 2014-06-18 | 47.93 |
| 2014-06-19 | 47.56 |
| 2014-06-20 | 47.34 |
| 2014-06-23 | 48.06 |
| 2014-06-24 | 47.81 |
| 2014-06-25 | 47.82 |
| 2014-06-26 | 47.23 |
| 2014-06-27 | 47.14 |
| 2014-06-30 | 47.1 |
| 2014-07-01 | 47.46 |
| 2014-07-02 | 48.01 |
| 2014-07-03 | 48.24 |
| 2014-07-04 | 48.24 |
| 2014-07-07 | 47.98 |
| 2014-07-08 | 47.42 |
| 2014-07-09 | 47.38 |
| 2014-07-10 | 46.9 |
| 2014-07-11 | 47 |
| 2014-07-14 | 48.42 |
| 2014-07-15 | 49.29 |
| 2014-07-16 | 49.82 |
| 2014-07-17 | 49.18 |
| 2014-07-18 | 49.56 |
| 2014-07-21 | 49.35 |
| 2014-07-22 | 49.6 |
| 2014-07-23 | 50.18 |
| 2014-07-24 | 50.09 |
| 2014-07-25 | 50.03 |
| 2014-07-28 | 49.7 |
| 2014-07-29 | 49.42 |
| 2014-07-30 | 50 |
| 2014-07-31 | 48.91 |
| 2014-08-01 | 48.1 |
| 2014-08-04 | 48.34 |
| 2014-08-05 | 47.89 |
| 2014-08-06 | 48.14 |
| 2014-08-07 | 48.06 |
| 2014-08-08 | 48.45 |
| 2014-08-11 | 48.39 |
| 2014-08-12 | 48.44 |
| 2014-08-13 | 48.75 |
| 2014-08-14 | 49.13 |
| 2014-08-15 | 48.72 |
| 2014-08-18 | 49.51 |
| 2014-08-19 | 49.7 |
| 2014-08-20 | 49.8 |
| 2014-08-21 | 51.07 |
| 2014-08-22 | 50.93 |
| 2014-08-25 | 51.63 |
| 2014-08-26 | 52.13 |
| 2014-08-27 | 51.86 |
| 2014-08-28 | 51.39 |
| 2014-08-29 | 51.65 |
| 2014-09-01 | 51.65 |
| 2014-09-02 | 51.96 |
| 2014-09-03 | 52.23 |
| 2014-09-04 | 52.47 |
| 2014-09-05 | 52.3 |
| 2014-09-08 | 52.05 |
| 2014-09-09 | 51.26 |
| 2014-09-10 | 51.83 |
| 2014-09-11 | 52.23 |
| 2014-09-12 | 52.38 |
| 2014-09-15 | 52.31 |
| 2014-09-16 | 52.36 |
| 2014-09-17 | 52.39 |
| 2014-09-18 | 53.66 |
| 2014-09-19 | 53.48 |
| 2014-09-22 | 53.04 |
| 2014-09-23 | 52.84 |
| 2014-09-24 | 53.26 |
| 2014-09-25 | 51.96 |
| 2014-09-26 | 52.49 |
| 2014-09-29 | 52.05 |
| 2014-09-30 | 51.82 |
| 2014-10-01 | 51.1 |
| 2014-10-02 | 51.25 |
| 2014-10-03 | 52.32 |
| 2014-10-06 | 52.28 |
| 2014-10-07 | 51.27 |
| 2014-10-08 | 52.54 |
| 2014-10-09 | 51.14 |
| 2014-10-10 | 50.11 |
| 2014-10-13 | 49.9 |
| 2014-10-14 | 51.47 |
| 2014-10-15 | 49.68 |
| 2014-10-16 | 49.75 |
| 2014-10-17 | 50.07 |
| 2014-10-20 | 50.53 |
| 2014-10-21 | 51.27 |
| 2014-10-22 | 50.7 |
| 2014-10-23 | 51.41 |
| 2014-10-24 | 51.8 |
| 2014-10-27 | 51.59 |
| 2014-10-28 | 52.44 |
| 2014-10-29 | 52.65 |
| 2014-10-30 | 53.15 |
| 2014-10-31 | 53.53 |
| 2014-11-03 | 53.47 |
| 2014-11-04 | 53.19 |
| 2014-11-05 | 54.02 |
| 2014-11-06 | 53.99 |
| 2014-11-07 | 53.75 |
| 2014-11-10 | 53.89 |
| 2014-11-11 | 53.81 |
| 2014-11-12 | 53.42 |
| 2014-11-13 | 53.44 |
| 2014-11-14 | 53.38 |
| 2014-11-17 | 53.57 |
| 2014-11-18 | 53.81 |
| 2014-11-19 | 53.66 |
| 2014-11-20 | 53.52 |
| 2014-11-21 | 53.66 |
| 2014-11-24 | 54.4 |
| 2014-11-25 | 54.33 |
| 2014-11-26 | 54.13 |
| 2014-11-27 | 54.13 |
| 2014-11-28 | 53.97 |
| 2014-12-01 | 53.35 |
| 2014-12-02 | 54.36 |
| 2014-12-03 | 55.21 |
| 2014-12-04 | 55.18 |
| 2014-12-05 | 56.08 |
| 2014-12-08 | 56.37 |
| 2014-12-09 | 55.85 |
| 2014-12-10 | 54.47 |
| 2014-12-11 | 54.51 |
| 2014-12-12 | 53.4 |
| 2014-12-15 | 52.79 |
| 2014-12-16 | 51.17 |
| 2014-12-17 | 52.45 |
| 2014-12-18 | 54.1 |
| 2014-12-19 | 54.01 |
| 2014-12-22 | 53.96 |
| 2014-12-23 | 54.42 |
| 2014-12-24 | 54.54 |
| 2014-12-25 | 54.54 |
| 2014-12-26 | 54.43 |
| 2014-12-29 | 54.73 |
| 2014-12-30 | 54.84 |
| 2014-12-31 | 54.11 |
| 2015-01-01 | 54.11 |
| 2015-01-02 | 54.26 |
| 2015-01-05 | 52.55 |
| 2015-01-06 | 50.7 |
| 2015-01-07 | 51.17 |
| 2015-01-08 | 51.94 |
| 2015-01-09 | 50.78 |
| 2015-01-12 | 50.38 |
| 2015-01-13 | 50.02 |
| 2015-01-14 | 49.05 |
| 2015-01-15 | 47.23 |
| 2015-01-16 | 47.61 |
| 2015-01-19 | 47.61 |
| 2015-01-20 | 47.26 |
| 2015-01-21 | 47.74 |
| 2015-01-22 | 49.57 |
| 2015-01-23 | 48.62 |
| 2015-01-26 | 48.89 |
| 2015-01-27 | 48.31 |
| 2015-01-28 | 47.11 |
| 2015-01-29 | 47.62 |
| 2015-01-30 | 46.95 |
| 2015-02-02 | 47.72 |
| 2015-02-03 | 48.88 |
| 2015-02-04 | 48.4 |
| 2015-02-05 | 48.54 |
| 2015-02-06 | 49.14 |
| 2015-02-09 | 49.21 |
| 2015-02-10 | 49.39 |
| 2015-02-11 | 49.68 |
| 2015-02-12 | 50.89 |
| 2015-02-13 | 51.2 |
| 2015-02-16 | 51.2 |
| 2015-02-17 | 51.69 |
| 2015-02-18 | 51.42 |
| 2015-02-19 | 51.12 |
| 2015-02-20 | 51.78 |
| 2015-02-23 | 51.32 |
| 2015-02-24 | 51.9 |
| 2015-02-25 | 52.09 |
| 2015-02-26 | 52.41 |
| 2015-02-27 | 52.42 |
| 2015-03-02 | 53.49 |
| 2015-03-03 | 53.73 |
| 2015-03-04 | 53.67 |
| 2015-03-05 | 53.56 |
| 2015-03-06 | 53.06 |
| 2015-03-09 | 52.95 |
| 2015-03-10 | 51.23 |
| 2015-03-11 | 52.33 |
| 2015-03-12 | 54.08 |
| 2015-03-13 | 53.54 |
| 2015-03-16 | 53.69 |
| 2015-03-17 | 53.84 |
| 2015-03-18 | 53.72 |
| 2015-03-19 | 52.38 |
| 2015-03-20 | 52.98 |
| 2015-03-23 | 52.48 |
| 2015-03-24 | 51.94 |
| 2015-03-25 | 51.38 |
| 2015-03-26 | 51.19 |
| 2015-03-27 | 51 |
| 2015-03-30 | 51.64 |
| 2015-03-31 | 51.52 |
| 2015-04-01 | 51.62 |
| 2015-04-02 | 51.86 |
| 2015-04-03 | 51.86 |
| 2015-04-06 | 51.62 |
| 2015-04-07 | 51.52 |
| 2015-04-08 | 51.89 |
| 2015-04-09 | 52.13 |
| 2015-04-10 | 52.43 |
| 2015-04-13 | 52.66 |
| 2015-04-14 | 52.73 |
| 2015-04-15 | 53.21 |
| 2015-04-16 | 54.02 |
| 2015-04-17 | 53.07 |
| 2015-04-20 | 53.2 |
| 2015-04-21 | 52.48 |
| 2015-04-22 | 53.1 |
| 2015-04-23 | 53.22 |
| 2015-04-24 | 52.9 |
| 2015-04-27 | 52.8 |
| 2015-04-28 | 53.02 |
| 2015-04-29 | 53.76 |
| 2015-04-30 | 53.32 |
| 2015-05-01 | 53.76 |
| 2015-05-04 | 54.17 |
| 2015-05-05 | 53.35 |
| 2015-05-06 | 52.82 |
| 2015-05-07 | 53.31 |
| 2015-05-08 | 54.02 |
| 2015-05-11 | 53.97 |
| 2015-05-12 | 53.74 |
| 2015-05-13 | 54.2 |
| 2015-05-14 | 54.6 |
| 2015-05-15 | 54.24 |
| 2015-05-18 | 54.67 |
| 2015-05-19 | 55.33 |
| 2015-05-20 | 54.89 |
| 2015-05-21 | 54.84 |
| 2015-05-22 | 54.97 |
| 2015-05-25 | 54.97 |
| 2015-05-26 | 54.24 |
| 2015-05-27 | 54.87 |
| 2015-05-28 | 54.55 |
| 2015-05-29 | 54.08 |
| 2015-06-01 | 54.45 |
| 2015-06-02 | 54.72 |
| 2015-06-03 | 55.63 |
| 2015-06-04 | 55.33 |
| 2015-06-05 | 56.24 |
| 2015-06-08 | 55.65 |
| 2015-06-09 | 56 |
| 2015-06-10 | 57.02 |
| 2015-06-11 | 57.21 |
| 2015-06-12 | 57.11 |
| 2015-06-15 | 56.65 |
| 2015-06-16 | 57.07 |
| 2015-06-17 | 56.54 |
| 2015-06-18 | 56.76 |
| 2015-06-19 | 56.23 |
| 2015-06-22 | 56.95 |
| 2015-06-23 | 57.39 |
| 2015-06-24 | 56.66 |
| 2015-06-25 | 56.19 |
| 2015-06-26 | 56.34 |
| 2015-06-29 | 54.88 |
| 2015-06-30 | 55.24 |
| 2015-07-01 | 55.68 |
| 2015-07-02 | 55.37 |
| 2015-07-03 | 55.37 |
| 2015-07-06 | 55.08 |
| 2015-07-07 | 54.5 |
| 2015-07-08 | 52.8 |
| 2015-07-09 | 53.71 |
| 2015-07-10 | 54.56 |
| 2015-07-13 | 55.54 |
| 2015-07-14 | 55.91 |
| 2015-07-15 | 56.46 |
| 2015-07-16 | 58.59 |
| 2015-07-17 | 58.75 |
| 2015-07-20 | 58.85 |
| 2015-07-21 | 59.1 |
| 2015-07-22 | 60.34 |
| 2015-07-23 | 59.87 |
| 2015-07-24 | 58.7 |
| 2015-07-27 | 57.96 |
| 2015-07-28 | 58.37 |
| 2015-07-29 | 58.92 |
| 2015-07-30 | 58.88 |
| 2015-07-31 | 58.46 |
| 2015-08-03 | 58.44 |
| 2015-08-04 | 58.47 |
| 2015-08-05 | 58.74 |
| 2015-08-06 | 58.1 |
| 2015-08-07 | 57.91 |
| 2015-08-10 | 58.74 |
| 2015-08-11 | 57.64 |
| 2015-08-12 | 56.91 |
| 2015-08-13 | 57.33 |
| 2015-08-14 | 57.59 |
| 2015-08-17 | 57.77 |
| 2015-08-18 | 57.55 |
| 2015-08-19 | 57 |
| 2015-08-20 | 55.33 |
| 2015-08-21 | 53.6 |
| 2015-08-24 | 50.34 |
| 2015-08-25 | 49.88 |
| 2015-08-26 | 52.28 |
| 2015-08-27 | 53.44 |
| 2015-08-28 | 53.28 |
| 2015-08-31 | 53.48 |
| 2015-09-01 | 50.94 |
| 2015-09-02 | 51.75 |
| 2015-09-03 | 51.79 |
| 2015-09-04 | 50.59 |
| 2015-09-07 | 50.59 |
| 2015-09-08 | 51.65 |
| 2015-09-09 | 50.88 |
| 2015-09-10 | 51.07 |
| 2015-09-11 | 51.1 |
| 2015-09-14 | 50.98 |
| 2015-09-15 | 52 |
| 2015-09-16 | 52.59 |
| 2015-09-17 | 51.65 |
| 2015-09-18 | 50.29 |
| 2015-09-21 | 50.71 |
| 2015-09-22 | 50.38 |
| 2015-09-23 | 50.12 |
| 2015-09-24 | 49.13 |
| 2015-09-25 | 50.55 |
| 2015-09-28 | 49.03 |
| 2015-09-29 | 49 |
| 2015-09-30 | 49.61 |
| 2015-10-01 | 49.89 |
| 2015-10-02 | 49.88 |
| 2015-10-05 | 51.16 |
| 2015-10-06 | 51.06 |
| 2015-10-07 | 51.32 |
| 2015-10-08 | 51.65 |
| 2015-10-09 | 51.38 |
| 2015-10-12 | 51.28 |
| 2015-10-13 | 51.21 |
| 2015-10-14 | 50.72 |
| 2015-10-15 | 52.97 |
| 2015-10-16 | 52.69 |
| 2015-10-19 | 52.86 |
| 2015-10-20 | 52.84 |
| 2015-10-21 | 51.81 |
| 2015-10-22 | 52.51 |
| 2015-10-23 | 53.64 |
| 2015-10-26 | 53.11 |
| 2015-10-27 | 52.61 |
| 2015-10-28 | 54.73 |
| 2015-10-29 | 53.66 |
| 2015-10-30 | 53.17 |
| 2015-11-02 | 53.83 |
| 2015-11-03 | 54.16 |
| 2015-11-04 | 53.83 |
| 2015-11-05 | 54.15 |
| 2015-11-06 | 55.87 |
| 2015-11-09 | 55.71 |
| 2015-11-10 | 55.8 |
| 2015-11-11 | 54.9 |
| 2015-11-12 | 53.46 |
| 2015-11-13 | 53.17 |
| 2015-11-16 | 53.69 |
| 2015-11-17 | 53.49 |
| 2015-11-18 | 54.98 |
| 2015-11-19 | 55.06 |
| 2015-11-20 | 54.75 |
| 2015-11-23 | 54.28 |
| 2015-11-24 | 54.18 |
| 2015-11-25 | 54.08 |
| 2015-11-26 | 54.08 |
| 2015-11-27 | 54.21 |
| 2015-11-30 | 54.09 |
| 2015-12-01 | 54.88 |
| 2015-12-02 | 54.14 |
| 2015-12-03 | 53.51 |
| 2015-12-04 | 55.09 |
| 2015-12-07 | 54.4 |
| 2015-12-08 | 53.39 |
| 2015-12-09 | 52.81 |
| 2015-12-10 | 52.65 |
| 2015-12-11 | 51.11 |
| 2015-12-14 | 51.1 |
| 2015-12-15 | 52.52 |
| 2015-12-16 | 53.9 |
| 2015-12-17 | 52.84 |
| 2015-12-18 | 51.21 |
| 2015-12-21 | 51.79 |
| 2015-12-22 | 52.01 |
| 2015-12-23 | 52.63 |
| 2015-12-24 | 52.71 |
| 2015-12-25 | 52.71 |
| 2015-12-28 | 52.38 |
| 2015-12-29 | 52.98 |
| 2015-12-30 | 52.3 |
| 2015-12-31 | 51.75 |
| 2016-01-01 | 51.75 |
| 2016-01-04 | 51.13 |
| 2016-01-05 | 50.86 |
| 2016-01-06 | 50.12 |
| 2016-01-07 | 47.56 |
| 2016-01-08 | 46.13 |
| 2016-01-11 | 46.85 |
| 2016-01-12 | 46.88 |
| 2016-01-13 | 45.19 |
| 2016-01-14 | 45.38 |
| 2016-01-15 | 42.47 |
| 2016-01-18 | 42.47 |
| 2016-01-19 | 41.94 |
| 2016-01-20 | 40.49 |
| 2016-01-21 | 40.15 |
| 2016-01-22 | 41.06 |
| 2016-01-25 | 39.55 |
| 2016-01-26 | 40.5 |
| 2016-01-27 | 40.56 |
| 2016-01-28 | 40.39 |
| 2016-01-29 | 42.58 |
| 2016-02-01 | 42.48 |
| 2016-02-02 | 40.42 |
| 2016-02-03 | 40.36 |
| 2016-02-04 | 40.79 |
| 2016-02-05 | 39.86 |
| 2016-02-08 | 37.81 |
| 2016-02-09 | 37.51 |
| 2016-02-10 | 37.41 |
| 2016-02-11 | 34.98 |
| 2016-02-12 | 37.54 |
| 2016-02-15 | 37.54 |
| 2016-02-16 | 38.89 |
| 2016-02-17 | 39.78 |
| 2016-02-18 | 38.92 |
| 2016-02-19 | 38.99 |
| 2016-02-22 | 39.52 |
| 2016-02-23 | 38.22 |
| 2016-02-24 | 38.09 |
| 2016-02-25 | 38.62 |
| 2016-02-26 | 39.5 |
| 2016-02-29 | 38.85 |
| 2016-03-01 | 41.27 |
| 2016-03-02 | 42.22 |
| 2016-03-03 | 42.83 |
| 2016-03-04 | 42.83 |
| 2016-03-07 | 42.61 |
| 2016-03-08 | 41.05 |
| 2016-03-09 | 41.15 |
| 2016-03-10 | 41.37 |
| 2016-03-11 | 42.99 |
| 2016-03-14 | 42.67 |
| 2016-03-15 | 42.59 |
| 2016-03-16 | 42.23 |
| 2016-03-17 | 42.85 |
| 2016-03-18 | 43.54 |
| 2016-03-21 | 43.6 |
| 2016-03-22 | 43.38 |
| 2016-03-23 | 42.37 |
| 2016-03-24 | 41.94 |
| 2016-03-25 | 41.94 |
| 2016-03-28 | 41.92 |
| 2016-03-29 | 41.72 |
| 2016-03-30 | 41.88 |
| 2016-03-31 | 41.75 |
| 2016-04-01 | 42.47 |
| 2016-04-04 | 42.06 |
| 2016-04-05 | 41.51 |
| 2016-04-06 | 41.86 |
| 2016-04-07 | 40.27 |
| 2016-04-08 | 40.47 |
| 2016-04-11 | 41.12 |
| 2016-04-12 | 41.9 |
| 2016-04-13 | 44.25 |
| 2016-04-14 | 44.98 |
| 2016-04-15 | 44.92 |
| 2016-04-18 | 45.11 |
| 2016-04-19 | 45.63 |
| 2016-04-20 | 46.74 |
| 2016-04-21 | 46.6 |
| 2016-04-22 | 46.97 |
| 2016-04-25 | 46.69 |
| 2016-04-26 | 47.1 |
| 2016-04-27 | 47.33 |
| 2016-04-28 | 46.73 |
| 2016-04-29 | 46.28 |
| 2016-05-02 | 46.68 |
| 2016-05-03 | 45.57 |
| 2016-05-04 | 44.66 |
| 2016-05-05 | 44.23 |
| 2016-05-06 | 44.41 |
| 2016-05-09 | 43.89 |
| 2016-05-10 | 44.84 |
| 2016-05-11 | 44.47 |
| 2016-05-12 | 44 |
| 2016-05-13 | 43.11 |
| 2016-05-16 | 43.15 |
| 2016-05-17 | 43.7 |
| 2016-05-18 | 45.87 |
| 2016-05-19 | 45.06 |
| 2016-05-20 | 44.9 |
| 2016-05-23 | 45.11 |
| 2016-05-24 | 45.86 |
| 2016-05-25 | 46.94 |
| 2016-05-26 | 46.11 |
| 2016-05-27 | 46.58 |
| 2016-05-30 | 46.58 |
| 2016-05-31 | 46.57 |
| 2016-06-01 | 46.94 |
| 2016-06-02 | 46.97 |
| 2016-06-03 | 45.39 |
| 2016-06-06 | 45.74 |
| 2016-06-07 | 45.54 |
| 2016-06-08 | 45.56 |
| 2016-06-09 | 45.01 |
| 2016-06-10 | 43.9 |
| 2016-06-13 | 43.16 |
| 2016-06-14 | 41.96 |
| 2016-06-15 | 42.01 |
| 2016-06-16 | 42.12 |
| 2016-06-17 | 42.48 |
| 2016-06-20 | 42.8 |
| 2016-06-21 | 42.92 |
| 2016-06-22 | 42.68 |
| 2016-06-23 | 44.46 |
| 2016-06-24 | 40.3 |
| 2016-06-27 | 38.48 |
| 2016-06-28 | 40.44 |
| 2016-06-29 | 42.12 |
| 2016-06-30 | 42.39 |
| 2016-07-01 | 42.17 |
| 2016-07-04 | 42.17 |
| 2016-07-05 | 40.78 |
| 2016-07-06 | 41.06 |
| 2016-07-07 | 41.29 |
| 2016-07-08 | 41.98 |
| 2016-07-11 | 42.29 |
| 2016-07-12 | 43.44 |
| 2016-07-13 | 43.33 |
| 2016-07-14 | 44.45 |
| 2016-07-15 | 44.33 |
| 2016-07-18 | 44.57 |
| 2016-07-19 | 44.35 |